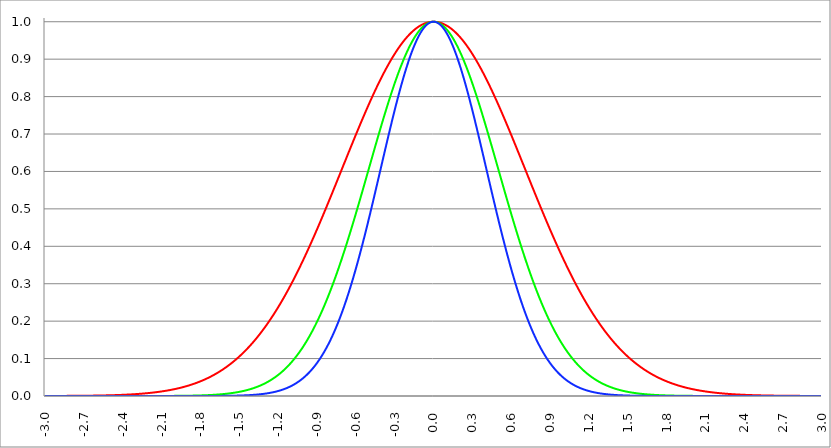
| Category | Series 1 | Series 0 | Series 2 |
|---|---|---|---|
| -3.0 | 0 | 0 | 0 |
| -2.997 | 0 | 0 | 0 |
| -2.994 | 0 | 0 | 0 |
| -2.991 | 0 | 0 | 0 |
| -2.988 | 0 | 0 | 0 |
| -2.984999999999999 | 0 | 0 | 0 |
| -2.981999999999999 | 0 | 0 | 0 |
| -2.978999999999999 | 0 | 0 | 0 |
| -2.975999999999999 | 0 | 0 | 0 |
| -2.972999999999999 | 0 | 0 | 0 |
| -2.969999999999999 | 0 | 0 | 0 |
| -2.966999999999999 | 0 | 0 | 0 |
| -2.963999999999999 | 0 | 0 | 0 |
| -2.960999999999998 | 0 | 0 | 0 |
| -2.957999999999998 | 0 | 0 | 0 |
| -2.954999999999998 | 0 | 0 | 0 |
| -2.951999999999998 | 0 | 0 | 0 |
| -2.948999999999998 | 0 | 0 | 0 |
| -2.945999999999998 | 0 | 0 | 0 |
| -2.942999999999998 | 0 | 0 | 0 |
| -2.939999999999998 | 0 | 0 | 0 |
| -2.936999999999998 | 0 | 0 | 0 |
| -2.933999999999997 | 0 | 0 | 0 |
| -2.930999999999997 | 0 | 0 | 0 |
| -2.927999999999997 | 0 | 0 | 0 |
| -2.924999999999997 | 0 | 0 | 0 |
| -2.921999999999997 | 0 | 0 | 0 |
| -2.918999999999997 | 0 | 0 | 0 |
| -2.915999999999997 | 0 | 0 | 0 |
| -2.912999999999997 | 0 | 0 | 0 |
| -2.909999999999997 | 0 | 0 | 0 |
| -2.906999999999996 | 0 | 0 | 0 |
| -2.903999999999996 | 0 | 0 | 0 |
| -2.900999999999996 | 0 | 0 | 0 |
| -2.897999999999996 | 0 | 0 | 0 |
| -2.894999999999996 | 0 | 0 | 0 |
| -2.891999999999996 | 0 | 0 | 0 |
| -2.888999999999996 | 0 | 0 | 0 |
| -2.885999999999996 | 0 | 0 | 0 |
| -2.882999999999996 | 0 | 0 | 0 |
| -2.879999999999995 | 0 | 0 | 0 |
| -2.876999999999995 | 0 | 0 | 0 |
| -2.873999999999995 | 0 | 0 | 0 |
| -2.870999999999995 | 0 | 0 | 0 |
| -2.867999999999995 | 0 | 0 | 0 |
| -2.864999999999995 | 0 | 0 | 0 |
| -2.861999999999995 | 0 | 0 | 0 |
| -2.858999999999995 | 0 | 0 | 0 |
| -2.855999999999994 | 0 | 0 | 0 |
| -2.852999999999994 | 0 | 0 | 0 |
| -2.849999999999994 | 0 | 0 | 0 |
| -2.846999999999994 | 0 | 0 | 0 |
| -2.843999999999994 | 0 | 0 | 0 |
| -2.840999999999994 | 0 | 0 | 0 |
| -2.837999999999994 | 0 | 0 | 0 |
| -2.834999999999994 | 0 | 0 | 0 |
| -2.831999999999994 | 0 | 0 | 0 |
| -2.828999999999993 | 0 | 0 | 0 |
| -2.825999999999993 | 0 | 0 | 0 |
| -2.822999999999993 | 0 | 0 | 0 |
| -2.819999999999993 | 0 | 0 | 0 |
| -2.816999999999993 | 0 | 0 | 0 |
| -2.813999999999993 | 0 | 0 | 0 |
| -2.810999999999993 | 0 | 0 | 0 |
| -2.807999999999993 | 0 | 0 | 0 |
| -2.804999999999993 | 0 | 0 | 0 |
| -2.801999999999992 | 0 | 0 | 0 |
| -2.798999999999992 | 0 | 0 | 0 |
| -2.795999999999992 | 0 | 0 | 0 |
| -2.792999999999992 | 0 | 0 | 0 |
| -2.789999999999992 | 0 | 0 | 0 |
| -2.786999999999992 | 0 | 0 | 0 |
| -2.783999999999992 | 0 | 0 | 0 |
| -2.780999999999992 | 0 | 0 | 0 |
| -2.777999999999992 | 0 | 0 | 0 |
| -2.774999999999991 | 0 | 0 | 0 |
| -2.771999999999991 | 0 | 0 | 0 |
| -2.768999999999991 | 0 | 0 | 0 |
| -2.765999999999991 | 0 | 0 | 0 |
| -2.762999999999991 | 0 | 0 | 0 |
| -2.759999999999991 | 0 | 0 | 0 |
| -2.756999999999991 | 0 | 0 | 0 |
| -2.753999999999991 | 0.001 | 0 | 0 |
| -2.75099999999999 | 0.001 | 0 | 0 |
| -2.74799999999999 | 0.001 | 0 | 0 |
| -2.74499999999999 | 0.001 | 0 | 0 |
| -2.74199999999999 | 0.001 | 0 | 0 |
| -2.73899999999999 | 0.001 | 0 | 0 |
| -2.73599999999999 | 0.001 | 0 | 0 |
| -2.73299999999999 | 0.001 | 0 | 0 |
| -2.72999999999999 | 0.001 | 0 | 0 |
| -2.72699999999999 | 0.001 | 0 | 0 |
| -2.723999999999989 | 0.001 | 0 | 0 |
| -2.720999999999989 | 0.001 | 0 | 0 |
| -2.717999999999989 | 0.001 | 0 | 0 |
| -2.714999999999989 | 0.001 | 0 | 0 |
| -2.711999999999989 | 0.001 | 0 | 0 |
| -2.708999999999989 | 0.001 | 0 | 0 |
| -2.705999999999989 | 0.001 | 0 | 0 |
| -2.702999999999989 | 0.001 | 0 | 0 |
| -2.699999999999989 | 0.001 | 0 | 0 |
| -2.696999999999988 | 0.001 | 0 | 0 |
| -2.693999999999988 | 0.001 | 0 | 0 |
| -2.690999999999988 | 0.001 | 0 | 0 |
| -2.687999999999988 | 0.001 | 0 | 0 |
| -2.684999999999988 | 0.001 | 0 | 0 |
| -2.681999999999988 | 0.001 | 0 | 0 |
| -2.678999999999988 | 0.001 | 0 | 0 |
| -2.675999999999988 | 0.001 | 0 | 0 |
| -2.672999999999988 | 0.001 | 0 | 0 |
| -2.669999999999987 | 0.001 | 0 | 0 |
| -2.666999999999987 | 0.001 | 0 | 0 |
| -2.663999999999987 | 0.001 | 0 | 0 |
| -2.660999999999987 | 0.001 | 0 | 0 |
| -2.657999999999987 | 0.001 | 0 | 0 |
| -2.654999999999987 | 0.001 | 0 | 0 |
| -2.651999999999987 | 0.001 | 0 | 0 |
| -2.648999999999987 | 0.001 | 0 | 0 |
| -2.645999999999986 | 0.001 | 0 | 0 |
| -2.642999999999986 | 0.001 | 0 | 0 |
| -2.639999999999986 | 0.001 | 0 | 0 |
| -2.636999999999986 | 0.001 | 0 | 0 |
| -2.633999999999986 | 0.001 | 0 | 0 |
| -2.630999999999986 | 0.001 | 0 | 0 |
| -2.627999999999986 | 0.001 | 0 | 0 |
| -2.624999999999986 | 0.001 | 0 | 0 |
| -2.621999999999986 | 0.001 | 0 | 0 |
| -2.618999999999985 | 0.001 | 0 | 0 |
| -2.615999999999985 | 0.001 | 0 | 0 |
| -2.612999999999985 | 0.001 | 0 | 0 |
| -2.609999999999985 | 0.001 | 0 | 0 |
| -2.606999999999985 | 0.001 | 0 | 0 |
| -2.603999999999985 | 0.001 | 0 | 0 |
| -2.600999999999985 | 0.001 | 0 | 0 |
| -2.597999999999985 | 0.001 | 0 | 0 |
| -2.594999999999985 | 0.001 | 0 | 0 |
| -2.591999999999985 | 0.001 | 0 | 0 |
| -2.588999999999984 | 0.001 | 0 | 0 |
| -2.585999999999984 | 0.001 | 0 | 0 |
| -2.582999999999984 | 0.001 | 0 | 0 |
| -2.579999999999984 | 0.001 | 0 | 0 |
| -2.576999999999984 | 0.001 | 0 | 0 |
| -2.573999999999984 | 0.001 | 0 | 0 |
| -2.570999999999984 | 0.001 | 0 | 0 |
| -2.567999999999984 | 0.001 | 0 | 0 |
| -2.564999999999984 | 0.001 | 0 | 0 |
| -2.561999999999983 | 0.001 | 0 | 0 |
| -2.558999999999983 | 0.001 | 0 | 0 |
| -2.555999999999983 | 0.001 | 0 | 0 |
| -2.552999999999983 | 0.001 | 0 | 0 |
| -2.549999999999983 | 0.001 | 0 | 0 |
| -2.546999999999983 | 0.002 | 0 | 0 |
| -2.543999999999983 | 0.002 | 0 | 0 |
| -2.540999999999983 | 0.002 | 0 | 0 |
| -2.537999999999982 | 0.002 | 0 | 0 |
| -2.534999999999982 | 0.002 | 0 | 0 |
| -2.531999999999982 | 0.002 | 0 | 0 |
| -2.528999999999982 | 0.002 | 0 | 0 |
| -2.525999999999982 | 0.002 | 0 | 0 |
| -2.522999999999982 | 0.002 | 0 | 0 |
| -2.519999999999982 | 0.002 | 0 | 0 |
| -2.516999999999982 | 0.002 | 0 | 0 |
| -2.513999999999982 | 0.002 | 0 | 0 |
| -2.510999999999981 | 0.002 | 0 | 0 |
| -2.507999999999981 | 0.002 | 0 | 0 |
| -2.504999999999981 | 0.002 | 0 | 0 |
| -2.501999999999981 | 0.002 | 0 | 0 |
| -2.498999999999981 | 0.002 | 0 | 0 |
| -2.495999999999981 | 0.002 | 0 | 0 |
| -2.492999999999981 | 0.002 | 0 | 0 |
| -2.489999999999981 | 0.002 | 0 | 0 |
| -2.486999999999981 | 0.002 | 0 | 0 |
| -2.48399999999998 | 0.002 | 0 | 0 |
| -2.48099999999998 | 0.002 | 0 | 0 |
| -2.47799999999998 | 0.002 | 0 | 0 |
| -2.47499999999998 | 0.002 | 0 | 0 |
| -2.47199999999998 | 0.002 | 0 | 0 |
| -2.46899999999998 | 0.002 | 0 | 0 |
| -2.46599999999998 | 0.002 | 0 | 0 |
| -2.46299999999998 | 0.002 | 0 | 0 |
| -2.45999999999998 | 0.002 | 0 | 0 |
| -2.456999999999979 | 0.002 | 0 | 0 |
| -2.453999999999979 | 0.002 | 0 | 0 |
| -2.450999999999979 | 0.002 | 0 | 0 |
| -2.44799999999998 | 0.002 | 0 | 0 |
| -2.444999999999979 | 0.003 | 0 | 0 |
| -2.441999999999979 | 0.003 | 0 | 0 |
| -2.438999999999979 | 0.003 | 0 | 0 |
| -2.435999999999979 | 0.003 | 0 | 0 |
| -2.432999999999978 | 0.003 | 0 | 0 |
| -2.429999999999978 | 0.003 | 0 | 0 |
| -2.426999999999978 | 0.003 | 0 | 0 |
| -2.423999999999978 | 0.003 | 0 | 0 |
| -2.420999999999978 | 0.003 | 0 | 0 |
| -2.417999999999978 | 0.003 | 0 | 0 |
| -2.414999999999978 | 0.003 | 0 | 0 |
| -2.411999999999978 | 0.003 | 0 | 0 |
| -2.408999999999978 | 0.003 | 0 | 0 |
| -2.405999999999977 | 0.003 | 0 | 0 |
| -2.402999999999977 | 0.003 | 0 | 0 |
| -2.399999999999977 | 0.003 | 0 | 0 |
| -2.396999999999977 | 0.003 | 0 | 0 |
| -2.393999999999977 | 0.003 | 0 | 0 |
| -2.390999999999977 | 0.003 | 0 | 0 |
| -2.387999999999977 | 0.003 | 0 | 0 |
| -2.384999999999977 | 0.003 | 0 | 0 |
| -2.381999999999977 | 0.003 | 0 | 0 |
| -2.378999999999976 | 0.003 | 0 | 0 |
| -2.375999999999976 | 0.004 | 0 | 0 |
| -2.372999999999976 | 0.004 | 0 | 0 |
| -2.369999999999976 | 0.004 | 0 | 0 |
| -2.366999999999976 | 0.004 | 0 | 0 |
| -2.363999999999976 | 0.004 | 0 | 0 |
| -2.360999999999976 | 0.004 | 0 | 0 |
| -2.357999999999976 | 0.004 | 0 | 0 |
| -2.354999999999976 | 0.004 | 0 | 0 |
| -2.351999999999975 | 0.004 | 0 | 0 |
| -2.348999999999975 | 0.004 | 0 | 0 |
| -2.345999999999975 | 0.004 | 0 | 0 |
| -2.342999999999975 | 0.004 | 0 | 0 |
| -2.339999999999975 | 0.004 | 0 | 0 |
| -2.336999999999975 | 0.004 | 0 | 0 |
| -2.333999999999975 | 0.004 | 0 | 0 |
| -2.330999999999975 | 0.004 | 0 | 0 |
| -2.327999999999974 | 0.004 | 0 | 0 |
| -2.324999999999974 | 0.004 | 0 | 0 |
| -2.321999999999974 | 0.005 | 0 | 0 |
| -2.318999999999974 | 0.005 | 0 | 0 |
| -2.315999999999974 | 0.005 | 0 | 0 |
| -2.312999999999974 | 0.005 | 0 | 0 |
| -2.309999999999974 | 0.005 | 0 | 0 |
| -2.306999999999974 | 0.005 | 0 | 0 |
| -2.303999999999974 | 0.005 | 0 | 0 |
| -2.300999999999973 | 0.005 | 0 | 0 |
| -2.297999999999973 | 0.005 | 0 | 0 |
| -2.294999999999973 | 0.005 | 0 | 0 |
| -2.291999999999973 | 0.005 | 0 | 0 |
| -2.288999999999973 | 0.005 | 0 | 0 |
| -2.285999999999973 | 0.005 | 0 | 0 |
| -2.282999999999973 | 0.005 | 0 | 0 |
| -2.279999999999973 | 0.006 | 0 | 0 |
| -2.276999999999973 | 0.006 | 0 | 0 |
| -2.273999999999972 | 0.006 | 0 | 0 |
| -2.270999999999972 | 0.006 | 0 | 0 |
| -2.267999999999972 | 0.006 | 0 | 0 |
| -2.264999999999972 | 0.006 | 0 | 0 |
| -2.261999999999972 | 0.006 | 0 | 0 |
| -2.258999999999972 | 0.006 | 0 | 0 |
| -2.255999999999972 | 0.006 | 0 | 0 |
| -2.252999999999972 | 0.006 | 0 | 0 |
| -2.249999999999972 | 0.006 | 0 | 0 |
| -2.246999999999971 | 0.006 | 0 | 0 |
| -2.243999999999971 | 0.007 | 0 | 0 |
| -2.240999999999971 | 0.007 | 0 | 0 |
| -2.237999999999971 | 0.007 | 0 | 0 |
| -2.234999999999971 | 0.007 | 0 | 0 |
| -2.231999999999971 | 0.007 | 0 | 0 |
| -2.228999999999971 | 0.007 | 0 | 0 |
| -2.225999999999971 | 0.007 | 0 | 0 |
| -2.222999999999971 | 0.007 | 0 | 0 |
| -2.21999999999997 | 0.007 | 0 | 0 |
| -2.21699999999997 | 0.007 | 0 | 0 |
| -2.21399999999997 | 0.007 | 0 | 0 |
| -2.21099999999997 | 0.008 | 0 | 0 |
| -2.20799999999997 | 0.008 | 0 | 0 |
| -2.20499999999997 | 0.008 | 0 | 0 |
| -2.20199999999997 | 0.008 | 0 | 0 |
| -2.19899999999997 | 0.008 | 0 | 0 |
| -2.19599999999997 | 0.008 | 0 | 0 |
| -2.192999999999969 | 0.008 | 0 | 0 |
| -2.189999999999969 | 0.008 | 0 | 0 |
| -2.186999999999969 | 0.008 | 0 | 0 |
| -2.18399999999997 | 0.008 | 0 | 0 |
| -2.180999999999969 | 0.009 | 0 | 0 |
| -2.177999999999969 | 0.009 | 0 | 0 |
| -2.174999999999969 | 0.009 | 0 | 0 |
| -2.171999999999969 | 0.009 | 0 | 0 |
| -2.168999999999968 | 0.009 | 0 | 0 |
| -2.165999999999968 | 0.009 | 0 | 0 |
| -2.162999999999968 | 0.009 | 0 | 0 |
| -2.159999999999968 | 0.009 | 0 | 0 |
| -2.156999999999968 | 0.01 | 0 | 0 |
| -2.153999999999968 | 0.01 | 0 | 0 |
| -2.150999999999968 | 0.01 | 0 | 0 |
| -2.147999999999968 | 0.01 | 0 | 0 |
| -2.144999999999968 | 0.01 | 0 | 0 |
| -2.141999999999967 | 0.01 | 0 | 0 |
| -2.138999999999967 | 0.01 | 0 | 0 |
| -2.135999999999967 | 0.01 | 0 | 0 |
| -2.132999999999967 | 0.011 | 0 | 0 |
| -2.129999999999967 | 0.011 | 0 | 0 |
| -2.126999999999967 | 0.011 | 0 | 0 |
| -2.123999999999967 | 0.011 | 0 | 0 |
| -2.120999999999967 | 0.011 | 0 | 0 |
| -2.117999999999967 | 0.011 | 0 | 0 |
| -2.114999999999966 | 0.011 | 0 | 0 |
| -2.111999999999966 | 0.012 | 0 | 0 |
| -2.108999999999966 | 0.012 | 0 | 0 |
| -2.105999999999966 | 0.012 | 0 | 0 |
| -2.102999999999966 | 0.012 | 0 | 0 |
| -2.099999999999966 | 0.012 | 0 | 0 |
| -2.096999999999966 | 0.012 | 0 | 0 |
| -2.093999999999966 | 0.012 | 0 | 0 |
| -2.090999999999966 | 0.013 | 0 | 0 |
| -2.087999999999965 | 0.013 | 0 | 0 |
| -2.084999999999965 | 0.013 | 0 | 0 |
| -2.081999999999965 | 0.013 | 0 | 0 |
| -2.078999999999965 | 0.013 | 0 | 0 |
| -2.075999999999965 | 0.013 | 0 | 0 |
| -2.072999999999965 | 0.014 | 0 | 0 |
| -2.069999999999965 | 0.014 | 0 | 0 |
| -2.066999999999965 | 0.014 | 0 | 0 |
| -2.063999999999965 | 0.014 | 0 | 0 |
| -2.060999999999964 | 0.014 | 0 | 0 |
| -2.057999999999964 | 0.014 | 0 | 0 |
| -2.054999999999964 | 0.015 | 0 | 0 |
| -2.051999999999964 | 0.015 | 0 | 0 |
| -2.048999999999964 | 0.015 | 0 | 0 |
| -2.045999999999964 | 0.015 | 0 | 0 |
| -2.042999999999964 | 0.015 | 0 | 0 |
| -2.039999999999964 | 0.016 | 0 | 0 |
| -2.036999999999963 | 0.016 | 0 | 0 |
| -2.033999999999963 | 0.016 | 0 | 0 |
| -2.030999999999963 | 0.016 | 0 | 0 |
| -2.027999999999963 | 0.016 | 0 | 0 |
| -2.024999999999963 | 0.017 | 0 | 0 |
| -2.021999999999963 | 0.017 | 0 | 0 |
| -2.018999999999963 | 0.017 | 0 | 0 |
| -2.015999999999963 | 0.017 | 0 | 0 |
| -2.012999999999963 | 0.017 | 0 | 0 |
| -2.009999999999962 | 0.018 | 0 | 0 |
| -2.006999999999962 | 0.018 | 0 | 0 |
| -2.003999999999962 | 0.018 | 0 | 0 |
| -2.000999999999962 | 0.018 | 0 | 0 |
| -1.997999999999962 | 0.018 | 0 | 0 |
| -1.994999999999962 | 0.019 | 0 | 0 |
| -1.991999999999962 | 0.019 | 0 | 0 |
| -1.988999999999963 | 0.019 | 0 | 0 |
| -1.985999999999963 | 0.019 | 0 | 0 |
| -1.982999999999963 | 0.02 | 0 | 0 |
| -1.979999999999963 | 0.02 | 0 | 0 |
| -1.976999999999963 | 0.02 | 0 | 0 |
| -1.973999999999963 | 0.02 | 0 | 0 |
| -1.970999999999963 | 0.021 | 0 | 0 |
| -1.967999999999963 | 0.021 | 0 | 0 |
| -1.964999999999963 | 0.021 | 0 | 0 |
| -1.961999999999964 | 0.021 | 0 | 0 |
| -1.958999999999964 | 0.022 | 0 | 0 |
| -1.955999999999964 | 0.022 | 0 | 0 |
| -1.952999999999964 | 0.022 | 0 | 0 |
| -1.949999999999964 | 0.022 | 0 | 0 |
| -1.946999999999964 | 0.023 | 0.001 | 0 |
| -1.943999999999964 | 0.023 | 0.001 | 0 |
| -1.940999999999964 | 0.023 | 0.001 | 0 |
| -1.937999999999964 | 0.023 | 0.001 | 0 |
| -1.934999999999964 | 0.024 | 0.001 | 0 |
| -1.931999999999965 | 0.024 | 0.001 | 0 |
| -1.928999999999965 | 0.024 | 0.001 | 0 |
| -1.925999999999965 | 0.024 | 0.001 | 0 |
| -1.922999999999965 | 0.025 | 0.001 | 0 |
| -1.919999999999965 | 0.025 | 0.001 | 0 |
| -1.916999999999965 | 0.025 | 0.001 | 0 |
| -1.913999999999965 | 0.026 | 0.001 | 0 |
| -1.910999999999965 | 0.026 | 0.001 | 0 |
| -1.907999999999965 | 0.026 | 0.001 | 0 |
| -1.904999999999966 | 0.027 | 0.001 | 0 |
| -1.901999999999966 | 0.027 | 0.001 | 0 |
| -1.898999999999966 | 0.027 | 0.001 | 0 |
| -1.895999999999966 | 0.027 | 0.001 | 0 |
| -1.892999999999966 | 0.028 | 0.001 | 0 |
| -1.889999999999966 | 0.028 | 0.001 | 0 |
| -1.886999999999966 | 0.028 | 0.001 | 0 |
| -1.883999999999966 | 0.029 | 0.001 | 0 |
| -1.880999999999966 | 0.029 | 0.001 | 0 |
| -1.877999999999967 | 0.029 | 0.001 | 0 |
| -1.874999999999967 | 0.03 | 0.001 | 0 |
| -1.871999999999967 | 0.03 | 0.001 | 0 |
| -1.868999999999967 | 0.03 | 0.001 | 0 |
| -1.865999999999967 | 0.031 | 0.001 | 0 |
| -1.862999999999967 | 0.031 | 0.001 | 0 |
| -1.859999999999967 | 0.031 | 0.001 | 0 |
| -1.856999999999967 | 0.032 | 0.001 | 0 |
| -1.853999999999967 | 0.032 | 0.001 | 0 |
| -1.850999999999968 | 0.033 | 0.001 | 0 |
| -1.847999999999968 | 0.033 | 0.001 | 0 |
| -1.844999999999968 | 0.033 | 0.001 | 0 |
| -1.841999999999968 | 0.034 | 0.001 | 0 |
| -1.838999999999968 | 0.034 | 0.001 | 0 |
| -1.835999999999968 | 0.034 | 0.001 | 0 |
| -1.832999999999968 | 0.035 | 0.001 | 0 |
| -1.829999999999968 | 0.035 | 0.001 | 0 |
| -1.826999999999968 | 0.036 | 0.001 | 0 |
| -1.823999999999968 | 0.036 | 0.001 | 0 |
| -1.820999999999969 | 0.036 | 0.001 | 0 |
| -1.817999999999969 | 0.037 | 0.001 | 0 |
| -1.814999999999969 | 0.037 | 0.001 | 0 |
| -1.811999999999969 | 0.038 | 0.001 | 0 |
| -1.808999999999969 | 0.038 | 0.001 | 0 |
| -1.805999999999969 | 0.038 | 0.001 | 0 |
| -1.802999999999969 | 0.039 | 0.002 | 0 |
| -1.799999999999969 | 0.039 | 0.002 | 0 |
| -1.796999999999969 | 0.04 | 0.002 | 0 |
| -1.79399999999997 | 0.04 | 0.002 | 0 |
| -1.79099999999997 | 0.04 | 0.002 | 0 |
| -1.78799999999997 | 0.041 | 0.002 | 0 |
| -1.78499999999997 | 0.041 | 0.002 | 0 |
| -1.78199999999997 | 0.042 | 0.002 | 0 |
| -1.77899999999997 | 0.042 | 0.002 | 0 |
| -1.77599999999997 | 0.043 | 0.002 | 0 |
| -1.77299999999997 | 0.043 | 0.002 | 0 |
| -1.76999999999997 | 0.044 | 0.002 | 0 |
| -1.766999999999971 | 0.044 | 0.002 | 0 |
| -1.763999999999971 | 0.045 | 0.002 | 0 |
| -1.760999999999971 | 0.045 | 0.002 | 0 |
| -1.757999999999971 | 0.045 | 0.002 | 0 |
| -1.754999999999971 | 0.046 | 0.002 | 0 |
| -1.751999999999971 | 0.046 | 0.002 | 0 |
| -1.748999999999971 | 0.047 | 0.002 | 0 |
| -1.745999999999971 | 0.047 | 0.002 | 0 |
| -1.742999999999971 | 0.048 | 0.002 | 0 |
| -1.739999999999971 | 0.048 | 0.002 | 0 |
| -1.736999999999972 | 0.049 | 0.002 | 0 |
| -1.733999999999972 | 0.049 | 0.002 | 0 |
| -1.730999999999972 | 0.05 | 0.002 | 0 |
| -1.727999999999972 | 0.05 | 0.003 | 0 |
| -1.724999999999972 | 0.051 | 0.003 | 0 |
| -1.721999999999972 | 0.052 | 0.003 | 0 |
| -1.718999999999972 | 0.052 | 0.003 | 0 |
| -1.715999999999972 | 0.053 | 0.003 | 0 |
| -1.712999999999972 | 0.053 | 0.003 | 0 |
| -1.709999999999973 | 0.054 | 0.003 | 0 |
| -1.706999999999973 | 0.054 | 0.003 | 0 |
| -1.703999999999973 | 0.055 | 0.003 | 0 |
| -1.700999999999973 | 0.055 | 0.003 | 0 |
| -1.697999999999973 | 0.056 | 0.003 | 0 |
| -1.694999999999973 | 0.057 | 0.003 | 0 |
| -1.691999999999973 | 0.057 | 0.003 | 0 |
| -1.688999999999973 | 0.058 | 0.003 | 0 |
| -1.685999999999973 | 0.058 | 0.003 | 0 |
| -1.682999999999974 | 0.059 | 0.003 | 0 |
| -1.679999999999974 | 0.059 | 0.004 | 0 |
| -1.676999999999974 | 0.06 | 0.004 | 0 |
| -1.673999999999974 | 0.061 | 0.004 | 0 |
| -1.670999999999974 | 0.061 | 0.004 | 0 |
| -1.667999999999974 | 0.062 | 0.004 | 0 |
| -1.664999999999974 | 0.063 | 0.004 | 0 |
| -1.661999999999974 | 0.063 | 0.004 | 0 |
| -1.658999999999974 | 0.064 | 0.004 | 0 |
| -1.655999999999975 | 0.064 | 0.004 | 0 |
| -1.652999999999975 | 0.065 | 0.004 | 0 |
| -1.649999999999975 | 0.066 | 0.004 | 0 |
| -1.646999999999975 | 0.066 | 0.004 | 0 |
| -1.643999999999975 | 0.067 | 0.004 | 0 |
| -1.640999999999975 | 0.068 | 0.005 | 0 |
| -1.637999999999975 | 0.068 | 0.005 | 0 |
| -1.634999999999975 | 0.069 | 0.005 | 0 |
| -1.631999999999975 | 0.07 | 0.005 | 0 |
| -1.628999999999975 | 0.07 | 0.005 | 0 |
| -1.625999999999976 | 0.071 | 0.005 | 0 |
| -1.622999999999976 | 0.072 | 0.005 | 0 |
| -1.619999999999976 | 0.072 | 0.005 | 0 |
| -1.616999999999976 | 0.073 | 0.005 | 0 |
| -1.613999999999976 | 0.074 | 0.005 | 0 |
| -1.610999999999976 | 0.075 | 0.006 | 0 |
| -1.607999999999976 | 0.075 | 0.006 | 0 |
| -1.604999999999976 | 0.076 | 0.006 | 0 |
| -1.601999999999976 | 0.077 | 0.006 | 0 |
| -1.598999999999977 | 0.078 | 0.006 | 0 |
| -1.595999999999977 | 0.078 | 0.006 | 0 |
| -1.592999999999977 | 0.079 | 0.006 | 0 |
| -1.589999999999977 | 0.08 | 0.006 | 0.001 |
| -1.586999999999977 | 0.081 | 0.006 | 0.001 |
| -1.583999999999977 | 0.081 | 0.007 | 0.001 |
| -1.580999999999977 | 0.082 | 0.007 | 0.001 |
| -1.577999999999977 | 0.083 | 0.007 | 0.001 |
| -1.574999999999978 | 0.084 | 0.007 | 0.001 |
| -1.571999999999978 | 0.084 | 0.007 | 0.001 |
| -1.568999999999978 | 0.085 | 0.007 | 0.001 |
| -1.565999999999978 | 0.086 | 0.007 | 0.001 |
| -1.562999999999978 | 0.087 | 0.008 | 0.001 |
| -1.559999999999978 | 0.088 | 0.008 | 0.001 |
| -1.556999999999978 | 0.089 | 0.008 | 0.001 |
| -1.553999999999978 | 0.089 | 0.008 | 0.001 |
| -1.550999999999978 | 0.09 | 0.008 | 0.001 |
| -1.547999999999978 | 0.091 | 0.008 | 0.001 |
| -1.544999999999979 | 0.092 | 0.008 | 0.001 |
| -1.541999999999979 | 0.093 | 0.009 | 0.001 |
| -1.538999999999979 | 0.094 | 0.009 | 0.001 |
| -1.535999999999979 | 0.094 | 0.009 | 0.001 |
| -1.532999999999979 | 0.095 | 0.009 | 0.001 |
| -1.529999999999979 | 0.096 | 0.009 | 0.001 |
| -1.526999999999979 | 0.097 | 0.009 | 0.001 |
| -1.523999999999979 | 0.098 | 0.01 | 0.001 |
| -1.520999999999979 | 0.099 | 0.01 | 0.001 |
| -1.51799999999998 | 0.1 | 0.01 | 0.001 |
| -1.51499999999998 | 0.101 | 0.01 | 0.001 |
| -1.51199999999998 | 0.102 | 0.01 | 0.001 |
| -1.50899999999998 | 0.103 | 0.011 | 0.001 |
| -1.50599999999998 | 0.104 | 0.011 | 0.001 |
| -1.50299999999998 | 0.104 | 0.011 | 0.001 |
| -1.49999999999998 | 0.105 | 0.011 | 0.001 |
| -1.49699999999998 | 0.106 | 0.011 | 0.001 |
| -1.49399999999998 | 0.107 | 0.012 | 0.001 |
| -1.490999999999981 | 0.108 | 0.012 | 0.001 |
| -1.487999999999981 | 0.109 | 0.012 | 0.001 |
| -1.484999999999981 | 0.11 | 0.012 | 0.001 |
| -1.481999999999981 | 0.111 | 0.012 | 0.001 |
| -1.478999999999981 | 0.112 | 0.013 | 0.001 |
| -1.475999999999981 | 0.113 | 0.013 | 0.001 |
| -1.472999999999981 | 0.114 | 0.013 | 0.001 |
| -1.469999999999981 | 0.115 | 0.013 | 0.002 |
| -1.466999999999981 | 0.116 | 0.014 | 0.002 |
| -1.463999999999982 | 0.117 | 0.014 | 0.002 |
| -1.460999999999982 | 0.118 | 0.014 | 0.002 |
| -1.457999999999982 | 0.119 | 0.014 | 0.002 |
| -1.454999999999982 | 0.12 | 0.014 | 0.002 |
| -1.451999999999982 | 0.121 | 0.015 | 0.002 |
| -1.448999999999982 | 0.123 | 0.015 | 0.002 |
| -1.445999999999982 | 0.124 | 0.015 | 0.002 |
| -1.442999999999982 | 0.125 | 0.016 | 0.002 |
| -1.439999999999982 | 0.126 | 0.016 | 0.002 |
| -1.436999999999982 | 0.127 | 0.016 | 0.002 |
| -1.433999999999983 | 0.128 | 0.016 | 0.002 |
| -1.430999999999983 | 0.129 | 0.017 | 0.002 |
| -1.427999999999983 | 0.13 | 0.017 | 0.002 |
| -1.424999999999983 | 0.131 | 0.017 | 0.002 |
| -1.421999999999983 | 0.132 | 0.018 | 0.002 |
| -1.418999999999983 | 0.134 | 0.018 | 0.002 |
| -1.415999999999983 | 0.135 | 0.018 | 0.002 |
| -1.412999999999983 | 0.136 | 0.018 | 0.003 |
| -1.409999999999983 | 0.137 | 0.019 | 0.003 |
| -1.406999999999984 | 0.138 | 0.019 | 0.003 |
| -1.403999999999984 | 0.139 | 0.019 | 0.003 |
| -1.400999999999984 | 0.14 | 0.02 | 0.003 |
| -1.397999999999984 | 0.142 | 0.02 | 0.003 |
| -1.394999999999984 | 0.143 | 0.02 | 0.003 |
| -1.391999999999984 | 0.144 | 0.021 | 0.003 |
| -1.388999999999984 | 0.145 | 0.021 | 0.003 |
| -1.385999999999984 | 0.146 | 0.021 | 0.003 |
| -1.382999999999984 | 0.148 | 0.022 | 0.003 |
| -1.379999999999985 | 0.149 | 0.022 | 0.003 |
| -1.376999999999985 | 0.15 | 0.023 | 0.003 |
| -1.373999999999985 | 0.151 | 0.023 | 0.003 |
| -1.370999999999985 | 0.153 | 0.023 | 0.004 |
| -1.367999999999985 | 0.154 | 0.024 | 0.004 |
| -1.364999999999985 | 0.155 | 0.024 | 0.004 |
| -1.361999999999985 | 0.156 | 0.024 | 0.004 |
| -1.358999999999985 | 0.158 | 0.025 | 0.004 |
| -1.355999999999985 | 0.159 | 0.025 | 0.004 |
| -1.352999999999985 | 0.16 | 0.026 | 0.004 |
| -1.349999999999986 | 0.162 | 0.026 | 0.004 |
| -1.346999999999986 | 0.163 | 0.027 | 0.004 |
| -1.343999999999986 | 0.164 | 0.027 | 0.004 |
| -1.340999999999986 | 0.166 | 0.027 | 0.005 |
| -1.337999999999986 | 0.167 | 0.028 | 0.005 |
| -1.334999999999986 | 0.168 | 0.028 | 0.005 |
| -1.331999999999986 | 0.17 | 0.029 | 0.005 |
| -1.328999999999986 | 0.171 | 0.029 | 0.005 |
| -1.325999999999986 | 0.172 | 0.03 | 0.005 |
| -1.322999999999987 | 0.174 | 0.03 | 0.005 |
| -1.319999999999987 | 0.175 | 0.031 | 0.005 |
| -1.316999999999987 | 0.176 | 0.031 | 0.005 |
| -1.313999999999987 | 0.178 | 0.032 | 0.006 |
| -1.310999999999987 | 0.179 | 0.032 | 0.006 |
| -1.307999999999987 | 0.181 | 0.033 | 0.006 |
| -1.304999999999987 | 0.182 | 0.033 | 0.006 |
| -1.301999999999987 | 0.184 | 0.034 | 0.006 |
| -1.298999999999987 | 0.185 | 0.034 | 0.006 |
| -1.295999999999988 | 0.186 | 0.035 | 0.006 |
| -1.292999999999988 | 0.188 | 0.035 | 0.007 |
| -1.289999999999988 | 0.189 | 0.036 | 0.007 |
| -1.286999999999988 | 0.191 | 0.036 | 0.007 |
| -1.283999999999988 | 0.192 | 0.037 | 0.007 |
| -1.280999999999988 | 0.194 | 0.038 | 0.007 |
| -1.277999999999988 | 0.195 | 0.038 | 0.007 |
| -1.274999999999988 | 0.197 | 0.039 | 0.008 |
| -1.271999999999988 | 0.198 | 0.039 | 0.008 |
| -1.268999999999989 | 0.2 | 0.04 | 0.008 |
| -1.265999999999989 | 0.201 | 0.041 | 0.008 |
| -1.262999999999989 | 0.203 | 0.041 | 0.008 |
| -1.259999999999989 | 0.204 | 0.042 | 0.009 |
| -1.256999999999989 | 0.206 | 0.042 | 0.009 |
| -1.253999999999989 | 0.208 | 0.043 | 0.009 |
| -1.250999999999989 | 0.209 | 0.044 | 0.009 |
| -1.247999999999989 | 0.211 | 0.044 | 0.009 |
| -1.244999999999989 | 0.212 | 0.045 | 0.01 |
| -1.24199999999999 | 0.214 | 0.046 | 0.01 |
| -1.23899999999999 | 0.215 | 0.046 | 0.01 |
| -1.23599999999999 | 0.217 | 0.047 | 0.01 |
| -1.23299999999999 | 0.219 | 0.048 | 0.01 |
| -1.22999999999999 | 0.22 | 0.049 | 0.011 |
| -1.22699999999999 | 0.222 | 0.049 | 0.011 |
| -1.22399999999999 | 0.224 | 0.05 | 0.011 |
| -1.22099999999999 | 0.225 | 0.051 | 0.011 |
| -1.21799999999999 | 0.227 | 0.051 | 0.012 |
| -1.214999999999991 | 0.228 | 0.052 | 0.012 |
| -1.211999999999991 | 0.23 | 0.053 | 0.012 |
| -1.208999999999991 | 0.232 | 0.054 | 0.012 |
| -1.205999999999991 | 0.234 | 0.055 | 0.013 |
| -1.202999999999991 | 0.235 | 0.055 | 0.013 |
| -1.199999999999991 | 0.237 | 0.056 | 0.013 |
| -1.196999999999991 | 0.239 | 0.057 | 0.014 |
| -1.193999999999991 | 0.24 | 0.058 | 0.014 |
| -1.190999999999991 | 0.242 | 0.059 | 0.014 |
| -1.187999999999991 | 0.244 | 0.059 | 0.014 |
| -1.184999999999992 | 0.246 | 0.06 | 0.015 |
| -1.181999999999992 | 0.247 | 0.061 | 0.015 |
| -1.178999999999992 | 0.249 | 0.062 | 0.015 |
| -1.175999999999992 | 0.251 | 0.063 | 0.016 |
| -1.172999999999992 | 0.253 | 0.064 | 0.016 |
| -1.169999999999992 | 0.254 | 0.065 | 0.016 |
| -1.166999999999992 | 0.256 | 0.066 | 0.017 |
| -1.163999999999992 | 0.258 | 0.067 | 0.017 |
| -1.160999999999992 | 0.26 | 0.067 | 0.018 |
| -1.157999999999993 | 0.262 | 0.068 | 0.018 |
| -1.154999999999993 | 0.263 | 0.069 | 0.018 |
| -1.151999999999993 | 0.265 | 0.07 | 0.019 |
| -1.148999999999993 | 0.267 | 0.071 | 0.019 |
| -1.145999999999993 | 0.269 | 0.072 | 0.019 |
| -1.142999999999993 | 0.271 | 0.073 | 0.02 |
| -1.139999999999993 | 0.273 | 0.074 | 0.02 |
| -1.136999999999993 | 0.275 | 0.075 | 0.021 |
| -1.133999999999993 | 0.276 | 0.076 | 0.021 |
| -1.130999999999994 | 0.278 | 0.077 | 0.022 |
| -1.127999999999994 | 0.28 | 0.078 | 0.022 |
| -1.124999999999994 | 0.282 | 0.08 | 0.022 |
| -1.121999999999994 | 0.284 | 0.081 | 0.023 |
| -1.118999999999994 | 0.286 | 0.082 | 0.023 |
| -1.115999999999994 | 0.288 | 0.083 | 0.024 |
| -1.112999999999994 | 0.29 | 0.084 | 0.024 |
| -1.109999999999994 | 0.292 | 0.085 | 0.025 |
| -1.106999999999994 | 0.294 | 0.086 | 0.025 |
| -1.103999999999995 | 0.296 | 0.087 | 0.026 |
| -1.100999999999995 | 0.298 | 0.089 | 0.026 |
| -1.097999999999995 | 0.3 | 0.09 | 0.027 |
| -1.094999999999995 | 0.301 | 0.091 | 0.027 |
| -1.091999999999995 | 0.303 | 0.092 | 0.028 |
| -1.088999999999995 | 0.305 | 0.093 | 0.029 |
| -1.085999999999995 | 0.307 | 0.095 | 0.029 |
| -1.082999999999995 | 0.309 | 0.096 | 0.03 |
| -1.079999999999995 | 0.311 | 0.097 | 0.03 |
| -1.076999999999996 | 0.314 | 0.098 | 0.031 |
| -1.073999999999996 | 0.316 | 0.1 | 0.031 |
| -1.070999999999996 | 0.318 | 0.101 | 0.032 |
| -1.067999999999996 | 0.32 | 0.102 | 0.033 |
| -1.064999999999996 | 0.322 | 0.103 | 0.033 |
| -1.061999999999996 | 0.324 | 0.105 | 0.034 |
| -1.058999999999996 | 0.326 | 0.106 | 0.035 |
| -1.055999999999996 | 0.328 | 0.107 | 0.035 |
| -1.052999999999996 | 0.33 | 0.109 | 0.036 |
| -1.049999999999996 | 0.332 | 0.11 | 0.037 |
| -1.046999999999997 | 0.334 | 0.112 | 0.037 |
| -1.043999999999997 | 0.336 | 0.113 | 0.038 |
| -1.040999999999997 | 0.338 | 0.114 | 0.039 |
| -1.037999999999997 | 0.34 | 0.116 | 0.039 |
| -1.034999999999997 | 0.343 | 0.117 | 0.04 |
| -1.031999999999997 | 0.345 | 0.119 | 0.041 |
| -1.028999999999997 | 0.347 | 0.12 | 0.042 |
| -1.025999999999997 | 0.349 | 0.122 | 0.043 |
| -1.022999999999997 | 0.351 | 0.123 | 0.043 |
| -1.019999999999998 | 0.353 | 0.125 | 0.044 |
| -1.016999999999998 | 0.355 | 0.126 | 0.045 |
| -1.013999999999998 | 0.358 | 0.128 | 0.046 |
| -1.010999999999998 | 0.36 | 0.129 | 0.047 |
| -1.007999999999998 | 0.362 | 0.131 | 0.047 |
| -1.004999999999998 | 0.364 | 0.133 | 0.048 |
| -1.001999999999998 | 0.366 | 0.134 | 0.049 |
| -0.998999999999998 | 0.369 | 0.136 | 0.05 |
| -0.995999999999998 | 0.371 | 0.138 | 0.051 |
| -0.992999999999998 | 0.373 | 0.139 | 0.052 |
| -0.989999999999998 | 0.375 | 0.141 | 0.053 |
| -0.986999999999998 | 0.378 | 0.143 | 0.054 |
| -0.983999999999998 | 0.38 | 0.144 | 0.055 |
| -0.980999999999998 | 0.382 | 0.146 | 0.056 |
| -0.977999999999998 | 0.384 | 0.148 | 0.057 |
| -0.974999999999998 | 0.386 | 0.149 | 0.058 |
| -0.971999999999998 | 0.389 | 0.151 | 0.059 |
| -0.968999999999998 | 0.391 | 0.153 | 0.06 |
| -0.965999999999998 | 0.393 | 0.155 | 0.061 |
| -0.962999999999998 | 0.396 | 0.156 | 0.062 |
| -0.959999999999998 | 0.398 | 0.158 | 0.063 |
| -0.956999999999998 | 0.4 | 0.16 | 0.064 |
| -0.953999999999998 | 0.402 | 0.162 | 0.065 |
| -0.950999999999998 | 0.405 | 0.164 | 0.066 |
| -0.947999999999998 | 0.407 | 0.166 | 0.067 |
| -0.944999999999998 | 0.409 | 0.168 | 0.069 |
| -0.941999999999998 | 0.412 | 0.17 | 0.07 |
| -0.938999999999998 | 0.414 | 0.171 | 0.071 |
| -0.935999999999998 | 0.416 | 0.173 | 0.072 |
| -0.932999999999998 | 0.419 | 0.175 | 0.073 |
| -0.929999999999998 | 0.421 | 0.177 | 0.075 |
| -0.926999999999998 | 0.423 | 0.179 | 0.076 |
| -0.923999999999998 | 0.426 | 0.181 | 0.077 |
| -0.920999999999998 | 0.428 | 0.183 | 0.078 |
| -0.917999999999998 | 0.431 | 0.185 | 0.08 |
| -0.914999999999998 | 0.433 | 0.187 | 0.081 |
| -0.911999999999998 | 0.435 | 0.189 | 0.082 |
| -0.908999999999998 | 0.438 | 0.192 | 0.084 |
| -0.905999999999998 | 0.44 | 0.194 | 0.085 |
| -0.902999999999998 | 0.442 | 0.196 | 0.087 |
| -0.899999999999998 | 0.445 | 0.198 | 0.088 |
| -0.896999999999998 | 0.447 | 0.2 | 0.089 |
| -0.893999999999998 | 0.45 | 0.202 | 0.091 |
| -0.890999999999998 | 0.452 | 0.204 | 0.092 |
| -0.887999999999998 | 0.455 | 0.207 | 0.094 |
| -0.884999999999998 | 0.457 | 0.209 | 0.095 |
| -0.881999999999998 | 0.459 | 0.211 | 0.097 |
| -0.878999999999998 | 0.462 | 0.213 | 0.098 |
| -0.875999999999998 | 0.464 | 0.216 | 0.1 |
| -0.872999999999998 | 0.467 | 0.218 | 0.102 |
| -0.869999999999998 | 0.469 | 0.22 | 0.103 |
| -0.866999999999998 | 0.472 | 0.222 | 0.105 |
| -0.863999999999998 | 0.474 | 0.225 | 0.107 |
| -0.860999999999998 | 0.476 | 0.227 | 0.108 |
| -0.857999999999998 | 0.479 | 0.229 | 0.11 |
| -0.854999999999998 | 0.481 | 0.232 | 0.112 |
| -0.851999999999998 | 0.484 | 0.234 | 0.113 |
| -0.848999999999998 | 0.486 | 0.237 | 0.115 |
| -0.845999999999998 | 0.489 | 0.239 | 0.117 |
| -0.842999999999998 | 0.491 | 0.241 | 0.119 |
| -0.839999999999998 | 0.494 | 0.244 | 0.12 |
| -0.836999999999998 | 0.496 | 0.246 | 0.122 |
| -0.833999999999998 | 0.499 | 0.249 | 0.124 |
| -0.830999999999998 | 0.501 | 0.251 | 0.126 |
| -0.827999999999998 | 0.504 | 0.254 | 0.128 |
| -0.824999999999998 | 0.506 | 0.256 | 0.13 |
| -0.821999999999998 | 0.509 | 0.259 | 0.132 |
| -0.818999999999998 | 0.511 | 0.261 | 0.134 |
| -0.815999999999998 | 0.514 | 0.264 | 0.136 |
| -0.812999999999998 | 0.516 | 0.267 | 0.138 |
| -0.809999999999998 | 0.519 | 0.269 | 0.14 |
| -0.806999999999998 | 0.521 | 0.272 | 0.142 |
| -0.803999999999998 | 0.524 | 0.274 | 0.144 |
| -0.800999999999998 | 0.526 | 0.277 | 0.146 |
| -0.797999999999998 | 0.529 | 0.28 | 0.148 |
| -0.794999999999998 | 0.532 | 0.283 | 0.15 |
| -0.791999999999998 | 0.534 | 0.285 | 0.152 |
| -0.788999999999998 | 0.537 | 0.288 | 0.154 |
| -0.785999999999998 | 0.539 | 0.291 | 0.157 |
| -0.782999999999998 | 0.542 | 0.293 | 0.159 |
| -0.779999999999998 | 0.544 | 0.296 | 0.161 |
| -0.776999999999998 | 0.547 | 0.299 | 0.163 |
| -0.773999999999998 | 0.549 | 0.302 | 0.166 |
| -0.770999999999998 | 0.552 | 0.305 | 0.168 |
| -0.767999999999998 | 0.554 | 0.307 | 0.17 |
| -0.764999999999998 | 0.557 | 0.31 | 0.173 |
| -0.761999999999998 | 0.56 | 0.313 | 0.175 |
| -0.758999999999998 | 0.562 | 0.316 | 0.178 |
| -0.755999999999998 | 0.565 | 0.319 | 0.18 |
| -0.752999999999998 | 0.567 | 0.322 | 0.182 |
| -0.749999999999998 | 0.57 | 0.325 | 0.185 |
| -0.746999999999998 | 0.572 | 0.328 | 0.187 |
| -0.743999999999998 | 0.575 | 0.331 | 0.19 |
| -0.740999999999998 | 0.577 | 0.333 | 0.193 |
| -0.737999999999998 | 0.58 | 0.336 | 0.195 |
| -0.734999999999998 | 0.583 | 0.339 | 0.198 |
| -0.731999999999998 | 0.585 | 0.342 | 0.2 |
| -0.728999999999998 | 0.588 | 0.345 | 0.203 |
| -0.725999999999998 | 0.59 | 0.348 | 0.206 |
| -0.722999999999998 | 0.593 | 0.352 | 0.208 |
| -0.719999999999998 | 0.595 | 0.355 | 0.211 |
| -0.716999999999998 | 0.598 | 0.358 | 0.214 |
| -0.713999999999998 | 0.601 | 0.361 | 0.217 |
| -0.710999999999998 | 0.603 | 0.364 | 0.219 |
| -0.707999999999998 | 0.606 | 0.367 | 0.222 |
| -0.704999999999998 | 0.608 | 0.37 | 0.225 |
| -0.701999999999998 | 0.611 | 0.373 | 0.228 |
| -0.698999999999998 | 0.613 | 0.376 | 0.231 |
| -0.695999999999998 | 0.616 | 0.38 | 0.234 |
| -0.692999999999998 | 0.619 | 0.383 | 0.237 |
| -0.689999999999998 | 0.621 | 0.386 | 0.24 |
| -0.686999999999998 | 0.624 | 0.389 | 0.243 |
| -0.683999999999998 | 0.626 | 0.392 | 0.246 |
| -0.680999999999998 | 0.629 | 0.396 | 0.249 |
| -0.677999999999998 | 0.631 | 0.399 | 0.252 |
| -0.674999999999998 | 0.634 | 0.402 | 0.255 |
| -0.671999999999998 | 0.637 | 0.405 | 0.258 |
| -0.668999999999998 | 0.639 | 0.409 | 0.261 |
| -0.665999999999998 | 0.642 | 0.412 | 0.264 |
| -0.662999999999998 | 0.644 | 0.415 | 0.267 |
| -0.659999999999998 | 0.647 | 0.418 | 0.271 |
| -0.656999999999998 | 0.649 | 0.422 | 0.274 |
| -0.653999999999998 | 0.652 | 0.425 | 0.277 |
| -0.650999999999998 | 0.655 | 0.428 | 0.28 |
| -0.647999999999998 | 0.657 | 0.432 | 0.284 |
| -0.644999999999998 | 0.66 | 0.435 | 0.287 |
| -0.641999999999998 | 0.662 | 0.439 | 0.29 |
| -0.638999999999998 | 0.665 | 0.442 | 0.294 |
| -0.635999999999998 | 0.667 | 0.445 | 0.297 |
| -0.632999999999998 | 0.67 | 0.449 | 0.301 |
| -0.629999999999998 | 0.672 | 0.452 | 0.304 |
| -0.626999999999998 | 0.675 | 0.456 | 0.307 |
| -0.623999999999998 | 0.677 | 0.459 | 0.311 |
| -0.620999999999998 | 0.68 | 0.462 | 0.314 |
| -0.617999999999998 | 0.683 | 0.466 | 0.318 |
| -0.614999999999998 | 0.685 | 0.469 | 0.322 |
| -0.611999999999998 | 0.688 | 0.473 | 0.325 |
| -0.608999999999998 | 0.69 | 0.476 | 0.329 |
| -0.605999999999998 | 0.693 | 0.48 | 0.332 |
| -0.602999999999998 | 0.695 | 0.483 | 0.336 |
| -0.599999999999998 | 0.698 | 0.487 | 0.34 |
| -0.596999999999998 | 0.7 | 0.49 | 0.343 |
| -0.593999999999998 | 0.703 | 0.494 | 0.347 |
| -0.590999999999998 | 0.705 | 0.497 | 0.351 |
| -0.587999999999998 | 0.708 | 0.501 | 0.354 |
| -0.584999999999998 | 0.71 | 0.504 | 0.358 |
| -0.581999999999998 | 0.713 | 0.508 | 0.362 |
| -0.578999999999998 | 0.715 | 0.511 | 0.366 |
| -0.575999999999998 | 0.718 | 0.515 | 0.37 |
| -0.572999999999998 | 0.72 | 0.519 | 0.373 |
| -0.569999999999998 | 0.723 | 0.522 | 0.377 |
| -0.566999999999998 | 0.725 | 0.526 | 0.381 |
| -0.563999999999998 | 0.728 | 0.529 | 0.385 |
| -0.560999999999998 | 0.73 | 0.533 | 0.389 |
| -0.557999999999998 | 0.732 | 0.536 | 0.393 |
| -0.554999999999998 | 0.735 | 0.54 | 0.397 |
| -0.551999999999998 | 0.737 | 0.544 | 0.401 |
| -0.548999999999998 | 0.74 | 0.547 | 0.405 |
| -0.545999999999998 | 0.742 | 0.551 | 0.409 |
| -0.542999999999998 | 0.745 | 0.554 | 0.413 |
| -0.539999999999998 | 0.747 | 0.558 | 0.417 |
| -0.536999999999998 | 0.749 | 0.562 | 0.421 |
| -0.533999999999998 | 0.752 | 0.565 | 0.425 |
| -0.530999999999998 | 0.754 | 0.569 | 0.429 |
| -0.527999999999998 | 0.757 | 0.573 | 0.433 |
| -0.524999999999998 | 0.759 | 0.576 | 0.437 |
| -0.521999999999998 | 0.761 | 0.58 | 0.442 |
| -0.518999999999998 | 0.764 | 0.583 | 0.446 |
| -0.515999999999998 | 0.766 | 0.587 | 0.45 |
| -0.512999999999998 | 0.769 | 0.591 | 0.454 |
| -0.509999999999998 | 0.771 | 0.594 | 0.458 |
| -0.506999999999998 | 0.773 | 0.598 | 0.462 |
| -0.503999999999998 | 0.776 | 0.602 | 0.467 |
| -0.500999999999998 | 0.778 | 0.605 | 0.471 |
| -0.497999999999998 | 0.78 | 0.609 | 0.475 |
| -0.494999999999998 | 0.783 | 0.613 | 0.479 |
| -0.491999999999998 | 0.785 | 0.616 | 0.484 |
| -0.488999999999998 | 0.787 | 0.62 | 0.488 |
| -0.485999999999998 | 0.79 | 0.624 | 0.492 |
| -0.482999999999998 | 0.792 | 0.627 | 0.497 |
| -0.479999999999998 | 0.794 | 0.631 | 0.501 |
| -0.476999999999998 | 0.796 | 0.634 | 0.505 |
| -0.473999999999998 | 0.799 | 0.638 | 0.51 |
| -0.470999999999998 | 0.801 | 0.642 | 0.514 |
| -0.467999999999998 | 0.803 | 0.645 | 0.518 |
| -0.464999999999998 | 0.806 | 0.649 | 0.523 |
| -0.461999999999998 | 0.808 | 0.653 | 0.527 |
| -0.458999999999998 | 0.81 | 0.656 | 0.532 |
| -0.455999999999998 | 0.812 | 0.66 | 0.536 |
| -0.452999999999998 | 0.814 | 0.663 | 0.54 |
| -0.449999999999998 | 0.817 | 0.667 | 0.545 |
| -0.446999999999998 | 0.819 | 0.671 | 0.549 |
| -0.443999999999998 | 0.821 | 0.674 | 0.554 |
| -0.440999999999998 | 0.823 | 0.678 | 0.558 |
| -0.437999999999998 | 0.825 | 0.681 | 0.562 |
| -0.434999999999998 | 0.828 | 0.685 | 0.567 |
| -0.431999999999998 | 0.83 | 0.688 | 0.571 |
| -0.428999999999998 | 0.832 | 0.692 | 0.576 |
| -0.425999999999998 | 0.834 | 0.696 | 0.58 |
| -0.422999999999998 | 0.836 | 0.699 | 0.585 |
| -0.419999999999998 | 0.838 | 0.703 | 0.589 |
| -0.416999999999998 | 0.84 | 0.706 | 0.594 |
| -0.413999999999998 | 0.842 | 0.71 | 0.598 |
| -0.410999999999998 | 0.845 | 0.713 | 0.602 |
| -0.407999999999998 | 0.847 | 0.717 | 0.607 |
| -0.404999999999998 | 0.849 | 0.72 | 0.611 |
| -0.401999999999998 | 0.851 | 0.724 | 0.616 |
| -0.398999999999998 | 0.853 | 0.727 | 0.62 |
| -0.395999999999998 | 0.855 | 0.731 | 0.625 |
| -0.392999999999998 | 0.857 | 0.734 | 0.629 |
| -0.389999999999998 | 0.859 | 0.738 | 0.634 |
| -0.386999999999998 | 0.861 | 0.741 | 0.638 |
| -0.383999999999998 | 0.863 | 0.745 | 0.643 |
| -0.380999999999998 | 0.865 | 0.748 | 0.647 |
| -0.377999999999998 | 0.867 | 0.751 | 0.651 |
| -0.374999999999998 | 0.869 | 0.755 | 0.656 |
| -0.371999999999998 | 0.871 | 0.758 | 0.66 |
| -0.368999999999998 | 0.873 | 0.762 | 0.665 |
| -0.365999999999998 | 0.875 | 0.765 | 0.669 |
| -0.362999999999998 | 0.877 | 0.768 | 0.673 |
| -0.359999999999998 | 0.878 | 0.772 | 0.678 |
| -0.356999999999998 | 0.88 | 0.775 | 0.682 |
| -0.353999999999998 | 0.882 | 0.778 | 0.687 |
| -0.350999999999998 | 0.884 | 0.782 | 0.691 |
| -0.347999999999998 | 0.886 | 0.785 | 0.695 |
| -0.344999999999998 | 0.888 | 0.788 | 0.7 |
| -0.341999999999998 | 0.89 | 0.791 | 0.704 |
| -0.338999999999998 | 0.891 | 0.795 | 0.708 |
| -0.335999999999998 | 0.893 | 0.798 | 0.713 |
| -0.332999999999998 | 0.895 | 0.801 | 0.717 |
| -0.329999999999998 | 0.897 | 0.804 | 0.721 |
| -0.326999999999998 | 0.899 | 0.807 | 0.726 |
| -0.323999999999998 | 0.9 | 0.811 | 0.73 |
| -0.320999999999998 | 0.902 | 0.814 | 0.734 |
| -0.317999999999998 | 0.904 | 0.817 | 0.738 |
| -0.314999999999998 | 0.906 | 0.82 | 0.743 |
| -0.311999999999998 | 0.907 | 0.823 | 0.747 |
| -0.308999999999998 | 0.909 | 0.826 | 0.751 |
| -0.305999999999998 | 0.911 | 0.829 | 0.755 |
| -0.302999999999998 | 0.912 | 0.832 | 0.759 |
| -0.299999999999998 | 0.914 | 0.835 | 0.763 |
| -0.296999999999998 | 0.916 | 0.838 | 0.767 |
| -0.293999999999998 | 0.917 | 0.841 | 0.772 |
| -0.290999999999998 | 0.919 | 0.844 | 0.776 |
| -0.287999999999998 | 0.92 | 0.847 | 0.78 |
| -0.284999999999998 | 0.922 | 0.85 | 0.784 |
| -0.281999999999998 | 0.924 | 0.853 | 0.788 |
| -0.278999999999998 | 0.925 | 0.856 | 0.792 |
| -0.275999999999998 | 0.927 | 0.859 | 0.796 |
| -0.272999999999998 | 0.928 | 0.862 | 0.8 |
| -0.269999999999998 | 0.93 | 0.864 | 0.804 |
| -0.266999999999998 | 0.931 | 0.867 | 0.807 |
| -0.263999999999998 | 0.933 | 0.87 | 0.811 |
| -0.260999999999998 | 0.934 | 0.873 | 0.815 |
| -0.257999999999998 | 0.936 | 0.875 | 0.819 |
| -0.254999999999998 | 0.937 | 0.878 | 0.823 |
| -0.251999999999998 | 0.938 | 0.881 | 0.827 |
| -0.248999999999998 | 0.94 | 0.883 | 0.83 |
| -0.245999999999998 | 0.941 | 0.886 | 0.834 |
| -0.242999999999998 | 0.943 | 0.889 | 0.838 |
| -0.239999999999998 | 0.944 | 0.891 | 0.841 |
| -0.236999999999998 | 0.945 | 0.894 | 0.845 |
| -0.233999999999998 | 0.947 | 0.896 | 0.849 |
| -0.230999999999998 | 0.948 | 0.899 | 0.852 |
| -0.227999999999998 | 0.949 | 0.901 | 0.856 |
| -0.224999999999998 | 0.951 | 0.904 | 0.859 |
| -0.221999999999998 | 0.952 | 0.906 | 0.863 |
| -0.218999999999998 | 0.953 | 0.909 | 0.866 |
| -0.215999999999998 | 0.954 | 0.911 | 0.869 |
| -0.212999999999998 | 0.956 | 0.913 | 0.873 |
| -0.209999999999998 | 0.957 | 0.916 | 0.876 |
| -0.206999999999998 | 0.958 | 0.918 | 0.879 |
| -0.203999999999998 | 0.959 | 0.92 | 0.883 |
| -0.200999999999998 | 0.96 | 0.922 | 0.886 |
| -0.197999999999997 | 0.962 | 0.925 | 0.889 |
| -0.194999999999997 | 0.963 | 0.927 | 0.892 |
| -0.191999999999997 | 0.964 | 0.929 | 0.895 |
| -0.188999999999997 | 0.965 | 0.931 | 0.898 |
| -0.185999999999997 | 0.966 | 0.933 | 0.901 |
| -0.182999999999997 | 0.967 | 0.935 | 0.904 |
| -0.179999999999997 | 0.968 | 0.937 | 0.907 |
| -0.176999999999997 | 0.969 | 0.939 | 0.91 |
| -0.173999999999997 | 0.97 | 0.941 | 0.913 |
| -0.170999999999997 | 0.971 | 0.943 | 0.916 |
| -0.167999999999997 | 0.972 | 0.945 | 0.919 |
| -0.164999999999997 | 0.973 | 0.947 | 0.922 |
| -0.161999999999997 | 0.974 | 0.949 | 0.924 |
| -0.158999999999997 | 0.975 | 0.951 | 0.927 |
| -0.155999999999997 | 0.976 | 0.952 | 0.93 |
| -0.152999999999997 | 0.977 | 0.954 | 0.932 |
| -0.149999999999997 | 0.978 | 0.956 | 0.935 |
| -0.146999999999997 | 0.979 | 0.958 | 0.937 |
| -0.143999999999997 | 0.979 | 0.959 | 0.94 |
| -0.140999999999997 | 0.98 | 0.961 | 0.942 |
| -0.137999999999997 | 0.981 | 0.963 | 0.944 |
| -0.134999999999997 | 0.982 | 0.964 | 0.947 |
| -0.131999999999997 | 0.983 | 0.966 | 0.949 |
| -0.128999999999997 | 0.983 | 0.967 | 0.951 |
| -0.125999999999997 | 0.984 | 0.969 | 0.953 |
| -0.122999999999997 | 0.985 | 0.97 | 0.956 |
| -0.119999999999997 | 0.986 | 0.972 | 0.958 |
| -0.116999999999997 | 0.986 | 0.973 | 0.96 |
| -0.113999999999997 | 0.987 | 0.974 | 0.962 |
| -0.110999999999997 | 0.988 | 0.976 | 0.964 |
| -0.107999999999997 | 0.988 | 0.977 | 0.966 |
| -0.104999999999997 | 0.989 | 0.978 | 0.967 |
| -0.101999999999997 | 0.99 | 0.979 | 0.969 |
| -0.0989999999999974 | 0.99 | 0.981 | 0.971 |
| -0.0959999999999974 | 0.991 | 0.982 | 0.973 |
| -0.0929999999999974 | 0.991 | 0.983 | 0.974 |
| -0.0899999999999974 | 0.992 | 0.984 | 0.976 |
| -0.0869999999999974 | 0.992 | 0.985 | 0.978 |
| -0.0839999999999974 | 0.993 | 0.986 | 0.979 |
| -0.0809999999999974 | 0.993 | 0.987 | 0.981 |
| -0.0779999999999974 | 0.994 | 0.988 | 0.982 |
| -0.0749999999999974 | 0.994 | 0.989 | 0.983 |
| -0.0719999999999974 | 0.995 | 0.99 | 0.985 |
| -0.0689999999999974 | 0.995 | 0.991 | 0.986 |
| -0.0659999999999974 | 0.996 | 0.991 | 0.987 |
| -0.0629999999999974 | 0.996 | 0.992 | 0.988 |
| -0.0599999999999974 | 0.996 | 0.993 | 0.989 |
| -0.0569999999999974 | 0.997 | 0.994 | 0.99 |
| -0.0539999999999974 | 0.997 | 0.994 | 0.991 |
| -0.0509999999999974 | 0.997 | 0.995 | 0.992 |
| -0.0479999999999974 | 0.998 | 0.995 | 0.993 |
| -0.0449999999999974 | 0.998 | 0.996 | 0.994 |
| -0.0419999999999974 | 0.998 | 0.996 | 0.995 |
| -0.0389999999999974 | 0.998 | 0.997 | 0.995 |
| -0.0359999999999974 | 0.999 | 0.997 | 0.996 |
| -0.0329999999999974 | 0.999 | 0.998 | 0.997 |
| -0.0299999999999974 | 0.999 | 0.998 | 0.997 |
| -0.0269999999999974 | 0.999 | 0.999 | 0.998 |
| -0.0239999999999974 | 0.999 | 0.999 | 0.998 |
| -0.0209999999999974 | 1 | 0.999 | 0.999 |
| -0.0179999999999974 | 1 | 0.999 | 0.999 |
| -0.0149999999999974 | 1 | 1 | 0.999 |
| -0.0119999999999974 | 1 | 1 | 1 |
| -0.00899999999999737 | 1 | 1 | 1 |
| -0.00599999999999737 | 1 | 1 | 1 |
| -0.00299999999999737 | 1 | 1 | 1 |
| 2.62897342784285e-15 | 1 | 1 | 1 |
| 0.00300000000000263 | 1 | 1 | 1 |
| 0.00600000000000263 | 1 | 1 | 1 |
| 0.00900000000000263 | 1 | 1 | 1 |
| 0.0120000000000026 | 1 | 1 | 1 |
| 0.0150000000000026 | 1 | 1 | 0.999 |
| 0.0180000000000026 | 1 | 0.999 | 0.999 |
| 0.0210000000000026 | 1 | 0.999 | 0.999 |
| 0.0240000000000026 | 0.999 | 0.999 | 0.998 |
| 0.0270000000000026 | 0.999 | 0.999 | 0.998 |
| 0.0300000000000026 | 0.999 | 0.998 | 0.997 |
| 0.0330000000000026 | 0.999 | 0.998 | 0.997 |
| 0.0360000000000026 | 0.999 | 0.997 | 0.996 |
| 0.0390000000000026 | 0.998 | 0.997 | 0.995 |
| 0.0420000000000026 | 0.998 | 0.996 | 0.995 |
| 0.0450000000000026 | 0.998 | 0.996 | 0.994 |
| 0.0480000000000026 | 0.998 | 0.995 | 0.993 |
| 0.0510000000000026 | 0.997 | 0.995 | 0.992 |
| 0.0540000000000026 | 0.997 | 0.994 | 0.991 |
| 0.0570000000000026 | 0.997 | 0.994 | 0.99 |
| 0.0600000000000026 | 0.996 | 0.993 | 0.989 |
| 0.0630000000000026 | 0.996 | 0.992 | 0.988 |
| 0.0660000000000026 | 0.996 | 0.991 | 0.987 |
| 0.0690000000000026 | 0.995 | 0.991 | 0.986 |
| 0.0720000000000027 | 0.995 | 0.99 | 0.985 |
| 0.0750000000000027 | 0.994 | 0.989 | 0.983 |
| 0.0780000000000027 | 0.994 | 0.988 | 0.982 |
| 0.0810000000000027 | 0.993 | 0.987 | 0.981 |
| 0.0840000000000027 | 0.993 | 0.986 | 0.979 |
| 0.0870000000000027 | 0.992 | 0.985 | 0.978 |
| 0.0900000000000027 | 0.992 | 0.984 | 0.976 |
| 0.0930000000000027 | 0.991 | 0.983 | 0.974 |
| 0.0960000000000027 | 0.991 | 0.982 | 0.973 |
| 0.0990000000000027 | 0.99 | 0.981 | 0.971 |
| 0.102000000000003 | 0.99 | 0.979 | 0.969 |
| 0.105000000000003 | 0.989 | 0.978 | 0.967 |
| 0.108000000000003 | 0.988 | 0.977 | 0.966 |
| 0.111000000000003 | 0.988 | 0.976 | 0.964 |
| 0.114000000000003 | 0.987 | 0.974 | 0.962 |
| 0.117000000000003 | 0.986 | 0.973 | 0.96 |
| 0.120000000000003 | 0.986 | 0.972 | 0.958 |
| 0.123000000000003 | 0.985 | 0.97 | 0.956 |
| 0.126000000000003 | 0.984 | 0.969 | 0.953 |
| 0.129000000000003 | 0.983 | 0.967 | 0.951 |
| 0.132000000000003 | 0.983 | 0.966 | 0.949 |
| 0.135000000000003 | 0.982 | 0.964 | 0.947 |
| 0.138000000000003 | 0.981 | 0.963 | 0.944 |
| 0.141000000000003 | 0.98 | 0.961 | 0.942 |
| 0.144000000000003 | 0.979 | 0.959 | 0.94 |
| 0.147000000000003 | 0.979 | 0.958 | 0.937 |
| 0.150000000000003 | 0.978 | 0.956 | 0.935 |
| 0.153000000000003 | 0.977 | 0.954 | 0.932 |
| 0.156000000000003 | 0.976 | 0.952 | 0.93 |
| 0.159000000000003 | 0.975 | 0.951 | 0.927 |
| 0.162000000000003 | 0.974 | 0.949 | 0.924 |
| 0.165000000000003 | 0.973 | 0.947 | 0.922 |
| 0.168000000000003 | 0.972 | 0.945 | 0.919 |
| 0.171000000000003 | 0.971 | 0.943 | 0.916 |
| 0.174000000000003 | 0.97 | 0.941 | 0.913 |
| 0.177000000000003 | 0.969 | 0.939 | 0.91 |
| 0.180000000000003 | 0.968 | 0.937 | 0.907 |
| 0.183000000000003 | 0.967 | 0.935 | 0.904 |
| 0.186000000000003 | 0.966 | 0.933 | 0.901 |
| 0.189000000000003 | 0.965 | 0.931 | 0.898 |
| 0.192000000000003 | 0.964 | 0.929 | 0.895 |
| 0.195000000000003 | 0.963 | 0.927 | 0.892 |
| 0.198000000000003 | 0.962 | 0.925 | 0.889 |
| 0.201000000000003 | 0.96 | 0.922 | 0.886 |
| 0.204000000000003 | 0.959 | 0.92 | 0.883 |
| 0.207000000000003 | 0.958 | 0.918 | 0.879 |
| 0.210000000000003 | 0.957 | 0.916 | 0.876 |
| 0.213000000000003 | 0.956 | 0.913 | 0.873 |
| 0.216000000000003 | 0.954 | 0.911 | 0.869 |
| 0.219000000000003 | 0.953 | 0.909 | 0.866 |
| 0.222000000000003 | 0.952 | 0.906 | 0.863 |
| 0.225000000000003 | 0.951 | 0.904 | 0.859 |
| 0.228000000000003 | 0.949 | 0.901 | 0.856 |
| 0.231000000000003 | 0.948 | 0.899 | 0.852 |
| 0.234000000000003 | 0.947 | 0.896 | 0.849 |
| 0.237000000000003 | 0.945 | 0.894 | 0.845 |
| 0.240000000000003 | 0.944 | 0.891 | 0.841 |
| 0.243000000000003 | 0.943 | 0.889 | 0.838 |
| 0.246000000000003 | 0.941 | 0.886 | 0.834 |
| 0.249000000000003 | 0.94 | 0.883 | 0.83 |
| 0.252000000000003 | 0.938 | 0.881 | 0.827 |
| 0.255000000000003 | 0.937 | 0.878 | 0.823 |
| 0.258000000000003 | 0.936 | 0.875 | 0.819 |
| 0.261000000000003 | 0.934 | 0.873 | 0.815 |
| 0.264000000000003 | 0.933 | 0.87 | 0.811 |
| 0.267000000000003 | 0.931 | 0.867 | 0.807 |
| 0.270000000000003 | 0.93 | 0.864 | 0.804 |
| 0.273000000000003 | 0.928 | 0.862 | 0.8 |
| 0.276000000000003 | 0.927 | 0.859 | 0.796 |
| 0.279000000000003 | 0.925 | 0.856 | 0.792 |
| 0.282000000000003 | 0.924 | 0.853 | 0.788 |
| 0.285000000000003 | 0.922 | 0.85 | 0.784 |
| 0.288000000000003 | 0.92 | 0.847 | 0.78 |
| 0.291000000000003 | 0.919 | 0.844 | 0.776 |
| 0.294000000000003 | 0.917 | 0.841 | 0.772 |
| 0.297000000000003 | 0.916 | 0.838 | 0.767 |
| 0.300000000000003 | 0.914 | 0.835 | 0.763 |
| 0.303000000000003 | 0.912 | 0.832 | 0.759 |
| 0.306000000000003 | 0.911 | 0.829 | 0.755 |
| 0.309000000000003 | 0.909 | 0.826 | 0.751 |
| 0.312000000000003 | 0.907 | 0.823 | 0.747 |
| 0.315000000000003 | 0.906 | 0.82 | 0.743 |
| 0.318000000000003 | 0.904 | 0.817 | 0.738 |
| 0.321000000000003 | 0.902 | 0.814 | 0.734 |
| 0.324000000000003 | 0.9 | 0.811 | 0.73 |
| 0.327000000000003 | 0.899 | 0.807 | 0.726 |
| 0.330000000000003 | 0.897 | 0.804 | 0.721 |
| 0.333000000000003 | 0.895 | 0.801 | 0.717 |
| 0.336000000000003 | 0.893 | 0.798 | 0.713 |
| 0.339000000000003 | 0.891 | 0.795 | 0.708 |
| 0.342000000000003 | 0.89 | 0.791 | 0.704 |
| 0.345000000000003 | 0.888 | 0.788 | 0.7 |
| 0.348000000000003 | 0.886 | 0.785 | 0.695 |
| 0.351000000000003 | 0.884 | 0.782 | 0.691 |
| 0.354000000000003 | 0.882 | 0.778 | 0.687 |
| 0.357000000000003 | 0.88 | 0.775 | 0.682 |
| 0.360000000000003 | 0.878 | 0.772 | 0.678 |
| 0.363000000000003 | 0.877 | 0.768 | 0.673 |
| 0.366000000000003 | 0.875 | 0.765 | 0.669 |
| 0.369000000000003 | 0.873 | 0.762 | 0.665 |
| 0.372000000000003 | 0.871 | 0.758 | 0.66 |
| 0.375000000000003 | 0.869 | 0.755 | 0.656 |
| 0.378000000000003 | 0.867 | 0.751 | 0.651 |
| 0.381000000000003 | 0.865 | 0.748 | 0.647 |
| 0.384000000000003 | 0.863 | 0.745 | 0.643 |
| 0.387000000000003 | 0.861 | 0.741 | 0.638 |
| 0.390000000000003 | 0.859 | 0.738 | 0.634 |
| 0.393000000000003 | 0.857 | 0.734 | 0.629 |
| 0.396000000000003 | 0.855 | 0.731 | 0.625 |
| 0.399000000000003 | 0.853 | 0.727 | 0.62 |
| 0.402000000000003 | 0.851 | 0.724 | 0.616 |
| 0.405000000000003 | 0.849 | 0.72 | 0.611 |
| 0.408000000000003 | 0.847 | 0.717 | 0.607 |
| 0.411000000000003 | 0.845 | 0.713 | 0.602 |
| 0.414000000000003 | 0.842 | 0.71 | 0.598 |
| 0.417000000000003 | 0.84 | 0.706 | 0.594 |
| 0.420000000000003 | 0.838 | 0.703 | 0.589 |
| 0.423000000000003 | 0.836 | 0.699 | 0.585 |
| 0.426000000000003 | 0.834 | 0.696 | 0.58 |
| 0.429000000000003 | 0.832 | 0.692 | 0.576 |
| 0.432000000000003 | 0.83 | 0.688 | 0.571 |
| 0.435000000000003 | 0.828 | 0.685 | 0.567 |
| 0.438000000000003 | 0.825 | 0.681 | 0.562 |
| 0.441000000000003 | 0.823 | 0.678 | 0.558 |
| 0.444000000000003 | 0.821 | 0.674 | 0.554 |
| 0.447000000000003 | 0.819 | 0.671 | 0.549 |
| 0.450000000000003 | 0.817 | 0.667 | 0.545 |
| 0.453000000000003 | 0.814 | 0.663 | 0.54 |
| 0.456000000000003 | 0.812 | 0.66 | 0.536 |
| 0.459000000000003 | 0.81 | 0.656 | 0.532 |
| 0.462000000000003 | 0.808 | 0.653 | 0.527 |
| 0.465000000000003 | 0.806 | 0.649 | 0.523 |
| 0.468000000000003 | 0.803 | 0.645 | 0.518 |
| 0.471000000000003 | 0.801 | 0.642 | 0.514 |
| 0.474000000000003 | 0.799 | 0.638 | 0.51 |
| 0.477000000000003 | 0.796 | 0.634 | 0.505 |
| 0.480000000000003 | 0.794 | 0.631 | 0.501 |
| 0.483000000000003 | 0.792 | 0.627 | 0.497 |
| 0.486000000000003 | 0.79 | 0.624 | 0.492 |
| 0.489000000000003 | 0.787 | 0.62 | 0.488 |
| 0.492000000000003 | 0.785 | 0.616 | 0.484 |
| 0.495000000000003 | 0.783 | 0.613 | 0.479 |
| 0.498000000000003 | 0.78 | 0.609 | 0.475 |
| 0.501000000000003 | 0.778 | 0.605 | 0.471 |
| 0.504000000000003 | 0.776 | 0.602 | 0.467 |
| 0.507000000000003 | 0.773 | 0.598 | 0.462 |
| 0.510000000000003 | 0.771 | 0.594 | 0.458 |
| 0.513000000000003 | 0.769 | 0.591 | 0.454 |
| 0.516000000000003 | 0.766 | 0.587 | 0.45 |
| 0.519000000000003 | 0.764 | 0.583 | 0.446 |
| 0.522000000000003 | 0.761 | 0.58 | 0.442 |
| 0.525000000000003 | 0.759 | 0.576 | 0.437 |
| 0.528000000000003 | 0.757 | 0.573 | 0.433 |
| 0.531000000000003 | 0.754 | 0.569 | 0.429 |
| 0.534000000000003 | 0.752 | 0.565 | 0.425 |
| 0.537000000000003 | 0.749 | 0.562 | 0.421 |
| 0.540000000000003 | 0.747 | 0.558 | 0.417 |
| 0.543000000000003 | 0.745 | 0.554 | 0.413 |
| 0.546000000000003 | 0.742 | 0.551 | 0.409 |
| 0.549000000000003 | 0.74 | 0.547 | 0.405 |
| 0.552000000000003 | 0.737 | 0.544 | 0.401 |
| 0.555000000000003 | 0.735 | 0.54 | 0.397 |
| 0.558000000000003 | 0.732 | 0.536 | 0.393 |
| 0.561000000000003 | 0.73 | 0.533 | 0.389 |
| 0.564000000000003 | 0.728 | 0.529 | 0.385 |
| 0.567000000000003 | 0.725 | 0.526 | 0.381 |
| 0.570000000000003 | 0.723 | 0.522 | 0.377 |
| 0.573000000000003 | 0.72 | 0.519 | 0.373 |
| 0.576000000000003 | 0.718 | 0.515 | 0.37 |
| 0.579000000000003 | 0.715 | 0.511 | 0.366 |
| 0.582000000000003 | 0.713 | 0.508 | 0.362 |
| 0.585000000000003 | 0.71 | 0.504 | 0.358 |
| 0.588000000000003 | 0.708 | 0.501 | 0.354 |
| 0.591000000000003 | 0.705 | 0.497 | 0.351 |
| 0.594000000000003 | 0.703 | 0.494 | 0.347 |
| 0.597000000000003 | 0.7 | 0.49 | 0.343 |
| 0.600000000000003 | 0.698 | 0.487 | 0.34 |
| 0.603000000000003 | 0.695 | 0.483 | 0.336 |
| 0.606000000000003 | 0.693 | 0.48 | 0.332 |
| 0.609000000000003 | 0.69 | 0.476 | 0.329 |
| 0.612000000000003 | 0.688 | 0.473 | 0.325 |
| 0.615000000000003 | 0.685 | 0.469 | 0.322 |
| 0.618000000000003 | 0.683 | 0.466 | 0.318 |
| 0.621000000000003 | 0.68 | 0.462 | 0.314 |
| 0.624000000000003 | 0.677 | 0.459 | 0.311 |
| 0.627000000000003 | 0.675 | 0.456 | 0.307 |
| 0.630000000000003 | 0.672 | 0.452 | 0.304 |
| 0.633000000000003 | 0.67 | 0.449 | 0.301 |
| 0.636000000000003 | 0.667 | 0.445 | 0.297 |
| 0.639000000000003 | 0.665 | 0.442 | 0.294 |
| 0.642000000000003 | 0.662 | 0.439 | 0.29 |
| 0.645000000000003 | 0.66 | 0.435 | 0.287 |
| 0.648000000000003 | 0.657 | 0.432 | 0.284 |
| 0.651000000000003 | 0.655 | 0.428 | 0.28 |
| 0.654000000000003 | 0.652 | 0.425 | 0.277 |
| 0.657000000000003 | 0.649 | 0.422 | 0.274 |
| 0.660000000000003 | 0.647 | 0.418 | 0.271 |
| 0.663000000000003 | 0.644 | 0.415 | 0.267 |
| 0.666000000000003 | 0.642 | 0.412 | 0.264 |
| 0.669000000000003 | 0.639 | 0.409 | 0.261 |
| 0.672000000000003 | 0.637 | 0.405 | 0.258 |
| 0.675000000000003 | 0.634 | 0.402 | 0.255 |
| 0.678000000000003 | 0.631 | 0.399 | 0.252 |
| 0.681000000000003 | 0.629 | 0.396 | 0.249 |
| 0.684000000000003 | 0.626 | 0.392 | 0.246 |
| 0.687000000000003 | 0.624 | 0.389 | 0.243 |
| 0.690000000000003 | 0.621 | 0.386 | 0.24 |
| 0.693000000000003 | 0.619 | 0.383 | 0.237 |
| 0.696000000000003 | 0.616 | 0.38 | 0.234 |
| 0.699000000000003 | 0.613 | 0.376 | 0.231 |
| 0.702000000000003 | 0.611 | 0.373 | 0.228 |
| 0.705000000000003 | 0.608 | 0.37 | 0.225 |
| 0.708000000000003 | 0.606 | 0.367 | 0.222 |
| 0.711000000000003 | 0.603 | 0.364 | 0.219 |
| 0.714000000000003 | 0.601 | 0.361 | 0.217 |
| 0.717000000000003 | 0.598 | 0.358 | 0.214 |
| 0.720000000000003 | 0.595 | 0.355 | 0.211 |
| 0.723000000000003 | 0.593 | 0.352 | 0.208 |
| 0.726000000000003 | 0.59 | 0.348 | 0.206 |
| 0.729000000000003 | 0.588 | 0.345 | 0.203 |
| 0.732000000000003 | 0.585 | 0.342 | 0.2 |
| 0.735000000000003 | 0.583 | 0.339 | 0.198 |
| 0.738000000000003 | 0.58 | 0.336 | 0.195 |
| 0.741000000000003 | 0.577 | 0.333 | 0.193 |
| 0.744000000000003 | 0.575 | 0.331 | 0.19 |
| 0.747000000000003 | 0.572 | 0.328 | 0.187 |
| 0.750000000000003 | 0.57 | 0.325 | 0.185 |
| 0.753000000000003 | 0.567 | 0.322 | 0.182 |
| 0.756000000000003 | 0.565 | 0.319 | 0.18 |
| 0.759000000000003 | 0.562 | 0.316 | 0.178 |
| 0.762000000000003 | 0.56 | 0.313 | 0.175 |
| 0.765000000000003 | 0.557 | 0.31 | 0.173 |
| 0.768000000000003 | 0.554 | 0.307 | 0.17 |
| 0.771000000000003 | 0.552 | 0.305 | 0.168 |
| 0.774000000000003 | 0.549 | 0.302 | 0.166 |
| 0.777000000000003 | 0.547 | 0.299 | 0.163 |
| 0.780000000000003 | 0.544 | 0.296 | 0.161 |
| 0.783000000000003 | 0.542 | 0.293 | 0.159 |
| 0.786000000000003 | 0.539 | 0.291 | 0.157 |
| 0.789000000000003 | 0.537 | 0.288 | 0.154 |
| 0.792000000000003 | 0.534 | 0.285 | 0.152 |
| 0.795000000000003 | 0.532 | 0.283 | 0.15 |
| 0.798000000000003 | 0.529 | 0.28 | 0.148 |
| 0.801000000000003 | 0.526 | 0.277 | 0.146 |
| 0.804000000000003 | 0.524 | 0.274 | 0.144 |
| 0.807000000000003 | 0.521 | 0.272 | 0.142 |
| 0.810000000000003 | 0.519 | 0.269 | 0.14 |
| 0.813000000000003 | 0.516 | 0.267 | 0.138 |
| 0.816000000000003 | 0.514 | 0.264 | 0.136 |
| 0.819000000000003 | 0.511 | 0.261 | 0.134 |
| 0.822000000000003 | 0.509 | 0.259 | 0.132 |
| 0.825000000000003 | 0.506 | 0.256 | 0.13 |
| 0.828000000000003 | 0.504 | 0.254 | 0.128 |
| 0.831000000000003 | 0.501 | 0.251 | 0.126 |
| 0.834000000000003 | 0.499 | 0.249 | 0.124 |
| 0.837000000000003 | 0.496 | 0.246 | 0.122 |
| 0.840000000000003 | 0.494 | 0.244 | 0.12 |
| 0.843000000000003 | 0.491 | 0.241 | 0.119 |
| 0.846000000000003 | 0.489 | 0.239 | 0.117 |
| 0.849000000000003 | 0.486 | 0.237 | 0.115 |
| 0.852000000000003 | 0.484 | 0.234 | 0.113 |
| 0.855000000000003 | 0.481 | 0.232 | 0.112 |
| 0.858000000000003 | 0.479 | 0.229 | 0.11 |
| 0.861000000000003 | 0.476 | 0.227 | 0.108 |
| 0.864000000000003 | 0.474 | 0.225 | 0.107 |
| 0.867000000000003 | 0.472 | 0.222 | 0.105 |
| 0.870000000000003 | 0.469 | 0.22 | 0.103 |
| 0.873000000000003 | 0.467 | 0.218 | 0.102 |
| 0.876000000000003 | 0.464 | 0.216 | 0.1 |
| 0.879000000000003 | 0.462 | 0.213 | 0.098 |
| 0.882000000000003 | 0.459 | 0.211 | 0.097 |
| 0.885000000000003 | 0.457 | 0.209 | 0.095 |
| 0.888000000000003 | 0.455 | 0.207 | 0.094 |
| 0.891000000000003 | 0.452 | 0.204 | 0.092 |
| 0.894000000000003 | 0.45 | 0.202 | 0.091 |
| 0.897000000000003 | 0.447 | 0.2 | 0.089 |
| 0.900000000000003 | 0.445 | 0.198 | 0.088 |
| 0.903000000000003 | 0.442 | 0.196 | 0.087 |
| 0.906000000000003 | 0.44 | 0.194 | 0.085 |
| 0.909000000000003 | 0.438 | 0.192 | 0.084 |
| 0.912000000000003 | 0.435 | 0.189 | 0.082 |
| 0.915000000000003 | 0.433 | 0.187 | 0.081 |
| 0.918000000000003 | 0.431 | 0.185 | 0.08 |
| 0.921000000000003 | 0.428 | 0.183 | 0.078 |
| 0.924000000000003 | 0.426 | 0.181 | 0.077 |
| 0.927000000000003 | 0.423 | 0.179 | 0.076 |
| 0.930000000000003 | 0.421 | 0.177 | 0.075 |
| 0.933000000000003 | 0.419 | 0.175 | 0.073 |
| 0.936000000000003 | 0.416 | 0.173 | 0.072 |
| 0.939000000000003 | 0.414 | 0.171 | 0.071 |
| 0.942000000000003 | 0.412 | 0.17 | 0.07 |
| 0.945000000000003 | 0.409 | 0.168 | 0.069 |
| 0.948000000000003 | 0.407 | 0.166 | 0.067 |
| 0.951000000000003 | 0.405 | 0.164 | 0.066 |
| 0.954000000000003 | 0.402 | 0.162 | 0.065 |
| 0.957000000000003 | 0.4 | 0.16 | 0.064 |
| 0.960000000000003 | 0.398 | 0.158 | 0.063 |
| 0.963000000000003 | 0.396 | 0.156 | 0.062 |
| 0.966000000000003 | 0.393 | 0.155 | 0.061 |
| 0.969000000000003 | 0.391 | 0.153 | 0.06 |
| 0.972000000000003 | 0.389 | 0.151 | 0.059 |
| 0.975000000000003 | 0.386 | 0.149 | 0.058 |
| 0.978000000000003 | 0.384 | 0.148 | 0.057 |
| 0.981000000000003 | 0.382 | 0.146 | 0.056 |
| 0.984000000000003 | 0.38 | 0.144 | 0.055 |
| 0.987000000000003 | 0.378 | 0.143 | 0.054 |
| 0.990000000000003 | 0.375 | 0.141 | 0.053 |
| 0.993000000000003 | 0.373 | 0.139 | 0.052 |
| 0.996000000000003 | 0.371 | 0.138 | 0.051 |
| 0.999000000000003 | 0.369 | 0.136 | 0.05 |
| 1.002000000000003 | 0.366 | 0.134 | 0.049 |
| 1.005000000000003 | 0.364 | 0.133 | 0.048 |
| 1.008000000000003 | 0.362 | 0.131 | 0.047 |
| 1.011000000000003 | 0.36 | 0.129 | 0.047 |
| 1.014000000000003 | 0.358 | 0.128 | 0.046 |
| 1.017000000000003 | 0.355 | 0.126 | 0.045 |
| 1.020000000000003 | 0.353 | 0.125 | 0.044 |
| 1.023000000000003 | 0.351 | 0.123 | 0.043 |
| 1.026000000000002 | 0.349 | 0.122 | 0.043 |
| 1.029000000000002 | 0.347 | 0.12 | 0.042 |
| 1.032000000000002 | 0.345 | 0.119 | 0.041 |
| 1.035000000000002 | 0.343 | 0.117 | 0.04 |
| 1.038000000000002 | 0.34 | 0.116 | 0.039 |
| 1.041000000000002 | 0.338 | 0.114 | 0.039 |
| 1.044000000000002 | 0.336 | 0.113 | 0.038 |
| 1.047000000000002 | 0.334 | 0.112 | 0.037 |
| 1.050000000000002 | 0.332 | 0.11 | 0.037 |
| 1.053000000000001 | 0.33 | 0.109 | 0.036 |
| 1.056000000000001 | 0.328 | 0.107 | 0.035 |
| 1.059000000000001 | 0.326 | 0.106 | 0.035 |
| 1.062000000000001 | 0.324 | 0.105 | 0.034 |
| 1.065000000000001 | 0.322 | 0.103 | 0.033 |
| 1.068000000000001 | 0.32 | 0.102 | 0.033 |
| 1.071000000000001 | 0.318 | 0.101 | 0.032 |
| 1.074000000000001 | 0.316 | 0.1 | 0.031 |
| 1.077000000000001 | 0.314 | 0.098 | 0.031 |
| 1.08 | 0.311 | 0.097 | 0.03 |
| 1.083 | 0.309 | 0.096 | 0.03 |
| 1.086 | 0.307 | 0.095 | 0.029 |
| 1.089 | 0.305 | 0.093 | 0.029 |
| 1.092 | 0.303 | 0.092 | 0.028 |
| 1.095 | 0.301 | 0.091 | 0.027 |
| 1.098 | 0.3 | 0.09 | 0.027 |
| 1.101 | 0.298 | 0.089 | 0.026 |
| 1.104 | 0.296 | 0.087 | 0.026 |
| 1.107 | 0.294 | 0.086 | 0.025 |
| 1.109999999999999 | 0.292 | 0.085 | 0.025 |
| 1.112999999999999 | 0.29 | 0.084 | 0.024 |
| 1.115999999999999 | 0.288 | 0.083 | 0.024 |
| 1.118999999999999 | 0.286 | 0.082 | 0.023 |
| 1.121999999999999 | 0.284 | 0.081 | 0.023 |
| 1.124999999999999 | 0.282 | 0.08 | 0.022 |
| 1.127999999999999 | 0.28 | 0.078 | 0.022 |
| 1.130999999999999 | 0.278 | 0.077 | 0.022 |
| 1.133999999999999 | 0.276 | 0.076 | 0.021 |
| 1.136999999999998 | 0.275 | 0.075 | 0.021 |
| 1.139999999999998 | 0.273 | 0.074 | 0.02 |
| 1.142999999999998 | 0.271 | 0.073 | 0.02 |
| 1.145999999999998 | 0.269 | 0.072 | 0.019 |
| 1.148999999999998 | 0.267 | 0.071 | 0.019 |
| 1.151999999999998 | 0.265 | 0.07 | 0.019 |
| 1.154999999999998 | 0.263 | 0.069 | 0.018 |
| 1.157999999999998 | 0.262 | 0.068 | 0.018 |
| 1.160999999999998 | 0.26 | 0.067 | 0.018 |
| 1.163999999999997 | 0.258 | 0.067 | 0.017 |
| 1.166999999999997 | 0.256 | 0.066 | 0.017 |
| 1.169999999999997 | 0.254 | 0.065 | 0.016 |
| 1.172999999999997 | 0.253 | 0.064 | 0.016 |
| 1.175999999999997 | 0.251 | 0.063 | 0.016 |
| 1.178999999999997 | 0.249 | 0.062 | 0.015 |
| 1.181999999999997 | 0.247 | 0.061 | 0.015 |
| 1.184999999999997 | 0.246 | 0.06 | 0.015 |
| 1.187999999999997 | 0.244 | 0.059 | 0.014 |
| 1.190999999999996 | 0.242 | 0.059 | 0.014 |
| 1.193999999999996 | 0.24 | 0.058 | 0.014 |
| 1.196999999999996 | 0.239 | 0.057 | 0.014 |
| 1.199999999999996 | 0.237 | 0.056 | 0.013 |
| 1.202999999999996 | 0.235 | 0.055 | 0.013 |
| 1.205999999999996 | 0.234 | 0.055 | 0.013 |
| 1.208999999999996 | 0.232 | 0.054 | 0.012 |
| 1.211999999999996 | 0.23 | 0.053 | 0.012 |
| 1.214999999999996 | 0.228 | 0.052 | 0.012 |
| 1.217999999999996 | 0.227 | 0.051 | 0.012 |
| 1.220999999999995 | 0.225 | 0.051 | 0.011 |
| 1.223999999999995 | 0.224 | 0.05 | 0.011 |
| 1.226999999999995 | 0.222 | 0.049 | 0.011 |
| 1.229999999999995 | 0.22 | 0.049 | 0.011 |
| 1.232999999999995 | 0.219 | 0.048 | 0.01 |
| 1.235999999999995 | 0.217 | 0.047 | 0.01 |
| 1.238999999999995 | 0.215 | 0.046 | 0.01 |
| 1.241999999999995 | 0.214 | 0.046 | 0.01 |
| 1.244999999999995 | 0.212 | 0.045 | 0.01 |
| 1.247999999999994 | 0.211 | 0.044 | 0.009 |
| 1.250999999999994 | 0.209 | 0.044 | 0.009 |
| 1.253999999999994 | 0.208 | 0.043 | 0.009 |
| 1.256999999999994 | 0.206 | 0.042 | 0.009 |
| 1.259999999999994 | 0.204 | 0.042 | 0.009 |
| 1.262999999999994 | 0.203 | 0.041 | 0.008 |
| 1.265999999999994 | 0.201 | 0.041 | 0.008 |
| 1.268999999999994 | 0.2 | 0.04 | 0.008 |
| 1.271999999999994 | 0.198 | 0.039 | 0.008 |
| 1.274999999999993 | 0.197 | 0.039 | 0.008 |
| 1.277999999999993 | 0.195 | 0.038 | 0.007 |
| 1.280999999999993 | 0.194 | 0.038 | 0.007 |
| 1.283999999999993 | 0.192 | 0.037 | 0.007 |
| 1.286999999999993 | 0.191 | 0.036 | 0.007 |
| 1.289999999999993 | 0.189 | 0.036 | 0.007 |
| 1.292999999999993 | 0.188 | 0.035 | 0.007 |
| 1.295999999999993 | 0.186 | 0.035 | 0.006 |
| 1.298999999999993 | 0.185 | 0.034 | 0.006 |
| 1.301999999999992 | 0.184 | 0.034 | 0.006 |
| 1.304999999999992 | 0.182 | 0.033 | 0.006 |
| 1.307999999999992 | 0.181 | 0.033 | 0.006 |
| 1.310999999999992 | 0.179 | 0.032 | 0.006 |
| 1.313999999999992 | 0.178 | 0.032 | 0.006 |
| 1.316999999999992 | 0.176 | 0.031 | 0.005 |
| 1.319999999999992 | 0.175 | 0.031 | 0.005 |
| 1.322999999999992 | 0.174 | 0.03 | 0.005 |
| 1.325999999999992 | 0.172 | 0.03 | 0.005 |
| 1.328999999999991 | 0.171 | 0.029 | 0.005 |
| 1.331999999999991 | 0.17 | 0.029 | 0.005 |
| 1.334999999999991 | 0.168 | 0.028 | 0.005 |
| 1.337999999999991 | 0.167 | 0.028 | 0.005 |
| 1.340999999999991 | 0.166 | 0.027 | 0.005 |
| 1.343999999999991 | 0.164 | 0.027 | 0.004 |
| 1.346999999999991 | 0.163 | 0.027 | 0.004 |
| 1.349999999999991 | 0.162 | 0.026 | 0.004 |
| 1.352999999999991 | 0.16 | 0.026 | 0.004 |
| 1.35599999999999 | 0.159 | 0.025 | 0.004 |
| 1.35899999999999 | 0.158 | 0.025 | 0.004 |
| 1.36199999999999 | 0.156 | 0.024 | 0.004 |
| 1.36499999999999 | 0.155 | 0.024 | 0.004 |
| 1.36799999999999 | 0.154 | 0.024 | 0.004 |
| 1.37099999999999 | 0.153 | 0.023 | 0.004 |
| 1.37399999999999 | 0.151 | 0.023 | 0.003 |
| 1.37699999999999 | 0.15 | 0.023 | 0.003 |
| 1.37999999999999 | 0.149 | 0.022 | 0.003 |
| 1.38299999999999 | 0.148 | 0.022 | 0.003 |
| 1.385999999999989 | 0.146 | 0.021 | 0.003 |
| 1.388999999999989 | 0.145 | 0.021 | 0.003 |
| 1.391999999999989 | 0.144 | 0.021 | 0.003 |
| 1.394999999999989 | 0.143 | 0.02 | 0.003 |
| 1.397999999999989 | 0.142 | 0.02 | 0.003 |
| 1.400999999999989 | 0.14 | 0.02 | 0.003 |
| 1.403999999999989 | 0.139 | 0.019 | 0.003 |
| 1.406999999999989 | 0.138 | 0.019 | 0.003 |
| 1.409999999999989 | 0.137 | 0.019 | 0.003 |
| 1.412999999999988 | 0.136 | 0.018 | 0.003 |
| 1.415999999999988 | 0.135 | 0.018 | 0.002 |
| 1.418999999999988 | 0.134 | 0.018 | 0.002 |
| 1.421999999999988 | 0.132 | 0.018 | 0.002 |
| 1.424999999999988 | 0.131 | 0.017 | 0.002 |
| 1.427999999999988 | 0.13 | 0.017 | 0.002 |
| 1.430999999999988 | 0.129 | 0.017 | 0.002 |
| 1.433999999999988 | 0.128 | 0.016 | 0.002 |
| 1.436999999999988 | 0.127 | 0.016 | 0.002 |
| 1.439999999999987 | 0.126 | 0.016 | 0.002 |
| 1.442999999999987 | 0.125 | 0.016 | 0.002 |
| 1.445999999999987 | 0.124 | 0.015 | 0.002 |
| 1.448999999999987 | 0.123 | 0.015 | 0.002 |
| 1.451999999999987 | 0.121 | 0.015 | 0.002 |
| 1.454999999999987 | 0.12 | 0.014 | 0.002 |
| 1.457999999999987 | 0.119 | 0.014 | 0.002 |
| 1.460999999999987 | 0.118 | 0.014 | 0.002 |
| 1.463999999999987 | 0.117 | 0.014 | 0.002 |
| 1.466999999999987 | 0.116 | 0.014 | 0.002 |
| 1.469999999999986 | 0.115 | 0.013 | 0.002 |
| 1.472999999999986 | 0.114 | 0.013 | 0.001 |
| 1.475999999999986 | 0.113 | 0.013 | 0.001 |
| 1.478999999999986 | 0.112 | 0.013 | 0.001 |
| 1.481999999999986 | 0.111 | 0.012 | 0.001 |
| 1.484999999999986 | 0.11 | 0.012 | 0.001 |
| 1.487999999999986 | 0.109 | 0.012 | 0.001 |
| 1.490999999999986 | 0.108 | 0.012 | 0.001 |
| 1.493999999999986 | 0.107 | 0.012 | 0.001 |
| 1.496999999999985 | 0.106 | 0.011 | 0.001 |
| 1.499999999999985 | 0.105 | 0.011 | 0.001 |
| 1.502999999999985 | 0.104 | 0.011 | 0.001 |
| 1.505999999999985 | 0.104 | 0.011 | 0.001 |
| 1.508999999999985 | 0.103 | 0.011 | 0.001 |
| 1.511999999999985 | 0.102 | 0.01 | 0.001 |
| 1.514999999999985 | 0.101 | 0.01 | 0.001 |
| 1.517999999999985 | 0.1 | 0.01 | 0.001 |
| 1.520999999999985 | 0.099 | 0.01 | 0.001 |
| 1.523999999999984 | 0.098 | 0.01 | 0.001 |
| 1.526999999999984 | 0.097 | 0.009 | 0.001 |
| 1.529999999999984 | 0.096 | 0.009 | 0.001 |
| 1.532999999999984 | 0.095 | 0.009 | 0.001 |
| 1.535999999999984 | 0.094 | 0.009 | 0.001 |
| 1.538999999999984 | 0.094 | 0.009 | 0.001 |
| 1.541999999999984 | 0.093 | 0.009 | 0.001 |
| 1.544999999999984 | 0.092 | 0.008 | 0.001 |
| 1.547999999999984 | 0.091 | 0.008 | 0.001 |
| 1.550999999999983 | 0.09 | 0.008 | 0.001 |
| 1.553999999999983 | 0.089 | 0.008 | 0.001 |
| 1.556999999999983 | 0.089 | 0.008 | 0.001 |
| 1.559999999999983 | 0.088 | 0.008 | 0.001 |
| 1.562999999999983 | 0.087 | 0.008 | 0.001 |
| 1.565999999999983 | 0.086 | 0.007 | 0.001 |
| 1.568999999999983 | 0.085 | 0.007 | 0.001 |
| 1.571999999999983 | 0.084 | 0.007 | 0.001 |
| 1.574999999999983 | 0.084 | 0.007 | 0.001 |
| 1.577999999999983 | 0.083 | 0.007 | 0.001 |
| 1.580999999999982 | 0.082 | 0.007 | 0.001 |
| 1.583999999999982 | 0.081 | 0.007 | 0.001 |
| 1.586999999999982 | 0.081 | 0.006 | 0.001 |
| 1.589999999999982 | 0.08 | 0.006 | 0.001 |
| 1.592999999999982 | 0.079 | 0.006 | 0 |
| 1.595999999999982 | 0.078 | 0.006 | 0 |
| 1.598999999999982 | 0.078 | 0.006 | 0 |
| 1.601999999999982 | 0.077 | 0.006 | 0 |
| 1.604999999999981 | 0.076 | 0.006 | 0 |
| 1.607999999999981 | 0.075 | 0.006 | 0 |
| 1.610999999999981 | 0.075 | 0.006 | 0 |
| 1.613999999999981 | 0.074 | 0.005 | 0 |
| 1.616999999999981 | 0.073 | 0.005 | 0 |
| 1.619999999999981 | 0.072 | 0.005 | 0 |
| 1.622999999999981 | 0.072 | 0.005 | 0 |
| 1.625999999999981 | 0.071 | 0.005 | 0 |
| 1.628999999999981 | 0.07 | 0.005 | 0 |
| 1.63199999999998 | 0.07 | 0.005 | 0 |
| 1.63499999999998 | 0.069 | 0.005 | 0 |
| 1.63799999999998 | 0.068 | 0.005 | 0 |
| 1.64099999999998 | 0.068 | 0.005 | 0 |
| 1.64399999999998 | 0.067 | 0.004 | 0 |
| 1.64699999999998 | 0.066 | 0.004 | 0 |
| 1.64999999999998 | 0.066 | 0.004 | 0 |
| 1.65299999999998 | 0.065 | 0.004 | 0 |
| 1.65599999999998 | 0.064 | 0.004 | 0 |
| 1.65899999999998 | 0.064 | 0.004 | 0 |
| 1.661999999999979 | 0.063 | 0.004 | 0 |
| 1.664999999999979 | 0.063 | 0.004 | 0 |
| 1.667999999999979 | 0.062 | 0.004 | 0 |
| 1.670999999999979 | 0.061 | 0.004 | 0 |
| 1.673999999999979 | 0.061 | 0.004 | 0 |
| 1.676999999999979 | 0.06 | 0.004 | 0 |
| 1.679999999999979 | 0.059 | 0.004 | 0 |
| 1.682999999999979 | 0.059 | 0.003 | 0 |
| 1.685999999999979 | 0.058 | 0.003 | 0 |
| 1.688999999999978 | 0.058 | 0.003 | 0 |
| 1.691999999999978 | 0.057 | 0.003 | 0 |
| 1.694999999999978 | 0.057 | 0.003 | 0 |
| 1.697999999999978 | 0.056 | 0.003 | 0 |
| 1.700999999999978 | 0.055 | 0.003 | 0 |
| 1.703999999999978 | 0.055 | 0.003 | 0 |
| 1.706999999999978 | 0.054 | 0.003 | 0 |
| 1.709999999999978 | 0.054 | 0.003 | 0 |
| 1.712999999999978 | 0.053 | 0.003 | 0 |
| 1.715999999999977 | 0.053 | 0.003 | 0 |
| 1.718999999999977 | 0.052 | 0.003 | 0 |
| 1.721999999999977 | 0.052 | 0.003 | 0 |
| 1.724999999999977 | 0.051 | 0.003 | 0 |
| 1.727999999999977 | 0.05 | 0.003 | 0 |
| 1.730999999999977 | 0.05 | 0.002 | 0 |
| 1.733999999999977 | 0.049 | 0.002 | 0 |
| 1.736999999999977 | 0.049 | 0.002 | 0 |
| 1.739999999999977 | 0.048 | 0.002 | 0 |
| 1.742999999999976 | 0.048 | 0.002 | 0 |
| 1.745999999999976 | 0.047 | 0.002 | 0 |
| 1.748999999999976 | 0.047 | 0.002 | 0 |
| 1.751999999999976 | 0.046 | 0.002 | 0 |
| 1.754999999999976 | 0.046 | 0.002 | 0 |
| 1.757999999999976 | 0.045 | 0.002 | 0 |
| 1.760999999999976 | 0.045 | 0.002 | 0 |
| 1.763999999999976 | 0.045 | 0.002 | 0 |
| 1.766999999999976 | 0.044 | 0.002 | 0 |
| 1.769999999999976 | 0.044 | 0.002 | 0 |
| 1.772999999999975 | 0.043 | 0.002 | 0 |
| 1.775999999999975 | 0.043 | 0.002 | 0 |
| 1.778999999999975 | 0.042 | 0.002 | 0 |
| 1.781999999999975 | 0.042 | 0.002 | 0 |
| 1.784999999999975 | 0.041 | 0.002 | 0 |
| 1.787999999999975 | 0.041 | 0.002 | 0 |
| 1.790999999999975 | 0.04 | 0.002 | 0 |
| 1.793999999999975 | 0.04 | 0.002 | 0 |
| 1.796999999999975 | 0.04 | 0.002 | 0 |
| 1.799999999999974 | 0.039 | 0.002 | 0 |
| 1.802999999999974 | 0.039 | 0.002 | 0 |
| 1.805999999999974 | 0.038 | 0.001 | 0 |
| 1.808999999999974 | 0.038 | 0.001 | 0 |
| 1.811999999999974 | 0.038 | 0.001 | 0 |
| 1.814999999999974 | 0.037 | 0.001 | 0 |
| 1.817999999999974 | 0.037 | 0.001 | 0 |
| 1.820999999999974 | 0.036 | 0.001 | 0 |
| 1.823999999999974 | 0.036 | 0.001 | 0 |
| 1.826999999999973 | 0.036 | 0.001 | 0 |
| 1.829999999999973 | 0.035 | 0.001 | 0 |
| 1.832999999999973 | 0.035 | 0.001 | 0 |
| 1.835999999999973 | 0.034 | 0.001 | 0 |
| 1.838999999999973 | 0.034 | 0.001 | 0 |
| 1.841999999999973 | 0.034 | 0.001 | 0 |
| 1.844999999999973 | 0.033 | 0.001 | 0 |
| 1.847999999999973 | 0.033 | 0.001 | 0 |
| 1.850999999999973 | 0.033 | 0.001 | 0 |
| 1.853999999999973 | 0.032 | 0.001 | 0 |
| 1.856999999999972 | 0.032 | 0.001 | 0 |
| 1.859999999999972 | 0.031 | 0.001 | 0 |
| 1.862999999999972 | 0.031 | 0.001 | 0 |
| 1.865999999999972 | 0.031 | 0.001 | 0 |
| 1.868999999999972 | 0.03 | 0.001 | 0 |
| 1.871999999999972 | 0.03 | 0.001 | 0 |
| 1.874999999999972 | 0.03 | 0.001 | 0 |
| 1.877999999999972 | 0.029 | 0.001 | 0 |
| 1.880999999999972 | 0.029 | 0.001 | 0 |
| 1.883999999999971 | 0.029 | 0.001 | 0 |
| 1.886999999999971 | 0.028 | 0.001 | 0 |
| 1.889999999999971 | 0.028 | 0.001 | 0 |
| 1.892999999999971 | 0.028 | 0.001 | 0 |
| 1.895999999999971 | 0.027 | 0.001 | 0 |
| 1.898999999999971 | 0.027 | 0.001 | 0 |
| 1.901999999999971 | 0.027 | 0.001 | 0 |
| 1.904999999999971 | 0.027 | 0.001 | 0 |
| 1.907999999999971 | 0.026 | 0.001 | 0 |
| 1.91099999999997 | 0.026 | 0.001 | 0 |
| 1.91399999999997 | 0.026 | 0.001 | 0 |
| 1.91699999999997 | 0.025 | 0.001 | 0 |
| 1.91999999999997 | 0.025 | 0.001 | 0 |
| 1.92299999999997 | 0.025 | 0.001 | 0 |
| 1.92599999999997 | 0.024 | 0.001 | 0 |
| 1.92899999999997 | 0.024 | 0.001 | 0 |
| 1.93199999999997 | 0.024 | 0.001 | 0 |
| 1.93499999999997 | 0.024 | 0.001 | 0 |
| 1.937999999999969 | 0.023 | 0.001 | 0 |
| 1.940999999999969 | 0.023 | 0.001 | 0 |
| 1.943999999999969 | 0.023 | 0.001 | 0 |
| 1.946999999999969 | 0.023 | 0.001 | 0 |
| 1.949999999999969 | 0.022 | 0 | 0 |
| 1.952999999999969 | 0.022 | 0 | 0 |
| 1.955999999999969 | 0.022 | 0 | 0 |
| 1.958999999999969 | 0.022 | 0 | 0 |
| 1.961999999999969 | 0.021 | 0 | 0 |
| 1.964999999999969 | 0.021 | 0 | 0 |
| 1.967999999999968 | 0.021 | 0 | 0 |
| 1.970999999999968 | 0.021 | 0 | 0 |
| 1.973999999999968 | 0.02 | 0 | 0 |
| 1.976999999999968 | 0.02 | 0 | 0 |
| 1.979999999999968 | 0.02 | 0 | 0 |
| 1.982999999999968 | 0.02 | 0 | 0 |
| 1.985999999999968 | 0.019 | 0 | 0 |
| 1.988999999999968 | 0.019 | 0 | 0 |
| 1.991999999999968 | 0.019 | 0 | 0 |
| 1.994999999999967 | 0.019 | 0 | 0 |
| 1.997999999999967 | 0.018 | 0 | 0 |
| 2.000999999999967 | 0.018 | 0 | 0 |
| 2.003999999999968 | 0.018 | 0 | 0 |
| 2.006999999999968 | 0.018 | 0 | 0 |
| 2.009999999999968 | 0.018 | 0 | 0 |
| 2.012999999999968 | 0.017 | 0 | 0 |
| 2.015999999999968 | 0.017 | 0 | 0 |
| 2.018999999999968 | 0.017 | 0 | 0 |
| 2.021999999999968 | 0.017 | 0 | 0 |
| 2.024999999999968 | 0.017 | 0 | 0 |
| 2.027999999999968 | 0.016 | 0 | 0 |
| 2.030999999999969 | 0.016 | 0 | 0 |
| 2.033999999999969 | 0.016 | 0 | 0 |
| 2.036999999999969 | 0.016 | 0 | 0 |
| 2.039999999999969 | 0.016 | 0 | 0 |
| 2.042999999999969 | 0.015 | 0 | 0 |
| 2.045999999999969 | 0.015 | 0 | 0 |
| 2.048999999999969 | 0.015 | 0 | 0 |
| 2.051999999999969 | 0.015 | 0 | 0 |
| 2.05499999999997 | 0.015 | 0 | 0 |
| 2.05799999999997 | 0.014 | 0 | 0 |
| 2.06099999999997 | 0.014 | 0 | 0 |
| 2.06399999999997 | 0.014 | 0 | 0 |
| 2.06699999999997 | 0.014 | 0 | 0 |
| 2.06999999999997 | 0.014 | 0 | 0 |
| 2.07299999999997 | 0.014 | 0 | 0 |
| 2.07599999999997 | 0.013 | 0 | 0 |
| 2.07899999999997 | 0.013 | 0 | 0 |
| 2.081999999999971 | 0.013 | 0 | 0 |
| 2.084999999999971 | 0.013 | 0 | 0 |
| 2.087999999999971 | 0.013 | 0 | 0 |
| 2.090999999999971 | 0.013 | 0 | 0 |
| 2.093999999999971 | 0.012 | 0 | 0 |
| 2.096999999999971 | 0.012 | 0 | 0 |
| 2.099999999999971 | 0.012 | 0 | 0 |
| 2.102999999999971 | 0.012 | 0 | 0 |
| 2.105999999999971 | 0.012 | 0 | 0 |
| 2.108999999999972 | 0.012 | 0 | 0 |
| 2.111999999999972 | 0.012 | 0 | 0 |
| 2.114999999999972 | 0.011 | 0 | 0 |
| 2.117999999999972 | 0.011 | 0 | 0 |
| 2.120999999999972 | 0.011 | 0 | 0 |
| 2.123999999999972 | 0.011 | 0 | 0 |
| 2.126999999999972 | 0.011 | 0 | 0 |
| 2.129999999999972 | 0.011 | 0 | 0 |
| 2.132999999999972 | 0.011 | 0 | 0 |
| 2.135999999999973 | 0.01 | 0 | 0 |
| 2.138999999999973 | 0.01 | 0 | 0 |
| 2.141999999999973 | 0.01 | 0 | 0 |
| 2.144999999999973 | 0.01 | 0 | 0 |
| 2.147999999999973 | 0.01 | 0 | 0 |
| 2.150999999999973 | 0.01 | 0 | 0 |
| 2.153999999999973 | 0.01 | 0 | 0 |
| 2.156999999999973 | 0.01 | 0 | 0 |
| 2.159999999999973 | 0.009 | 0 | 0 |
| 2.162999999999974 | 0.009 | 0 | 0 |
| 2.165999999999974 | 0.009 | 0 | 0 |
| 2.168999999999974 | 0.009 | 0 | 0 |
| 2.171999999999974 | 0.009 | 0 | 0 |
| 2.174999999999974 | 0.009 | 0 | 0 |
| 2.177999999999974 | 0.009 | 0 | 0 |
| 2.180999999999974 | 0.009 | 0 | 0 |
| 2.183999999999974 | 0.008 | 0 | 0 |
| 2.186999999999974 | 0.008 | 0 | 0 |
| 2.189999999999975 | 0.008 | 0 | 0 |
| 2.192999999999975 | 0.008 | 0 | 0 |
| 2.195999999999975 | 0.008 | 0 | 0 |
| 2.198999999999975 | 0.008 | 0 | 0 |
| 2.201999999999975 | 0.008 | 0 | 0 |
| 2.204999999999975 | 0.008 | 0 | 0 |
| 2.207999999999975 | 0.008 | 0 | 0 |
| 2.210999999999975 | 0.008 | 0 | 0 |
| 2.213999999999976 | 0.007 | 0 | 0 |
| 2.216999999999976 | 0.007 | 0 | 0 |
| 2.219999999999976 | 0.007 | 0 | 0 |
| 2.222999999999976 | 0.007 | 0 | 0 |
| 2.225999999999976 | 0.007 | 0 | 0 |
| 2.228999999999976 | 0.007 | 0 | 0 |
| 2.231999999999976 | 0.007 | 0 | 0 |
| 2.234999999999976 | 0.007 | 0 | 0 |
| 2.237999999999976 | 0.007 | 0 | 0 |
| 2.240999999999976 | 0.007 | 0 | 0 |
| 2.243999999999976 | 0.007 | 0 | 0 |
| 2.246999999999977 | 0.006 | 0 | 0 |
| 2.249999999999977 | 0.006 | 0 | 0 |
| 2.252999999999977 | 0.006 | 0 | 0 |
| 2.255999999999977 | 0.006 | 0 | 0 |
| 2.258999999999977 | 0.006 | 0 | 0 |
| 2.261999999999977 | 0.006 | 0 | 0 |
| 2.264999999999977 | 0.006 | 0 | 0 |
| 2.267999999999977 | 0.006 | 0 | 0 |
| 2.270999999999978 | 0.006 | 0 | 0 |
| 2.273999999999978 | 0.006 | 0 | 0 |
| 2.276999999999978 | 0.006 | 0 | 0 |
| 2.279999999999978 | 0.006 | 0 | 0 |
| 2.282999999999978 | 0.005 | 0 | 0 |
| 2.285999999999978 | 0.005 | 0 | 0 |
| 2.288999999999978 | 0.005 | 0 | 0 |
| 2.291999999999978 | 0.005 | 0 | 0 |
| 2.294999999999979 | 0.005 | 0 | 0 |
| 2.297999999999979 | 0.005 | 0 | 0 |
| 2.300999999999979 | 0.005 | 0 | 0 |
| 2.303999999999979 | 0.005 | 0 | 0 |
| 2.306999999999979 | 0.005 | 0 | 0 |
| 2.309999999999979 | 0.005 | 0 | 0 |
| 2.312999999999979 | 0.005 | 0 | 0 |
| 2.315999999999979 | 0.005 | 0 | 0 |
| 2.318999999999979 | 0.005 | 0 | 0 |
| 2.32199999999998 | 0.005 | 0 | 0 |
| 2.32499999999998 | 0.004 | 0 | 0 |
| 2.32799999999998 | 0.004 | 0 | 0 |
| 2.33099999999998 | 0.004 | 0 | 0 |
| 2.33399999999998 | 0.004 | 0 | 0 |
| 2.33699999999998 | 0.004 | 0 | 0 |
| 2.33999999999998 | 0.004 | 0 | 0 |
| 2.34299999999998 | 0.004 | 0 | 0 |
| 2.34599999999998 | 0.004 | 0 | 0 |
| 2.348999999999981 | 0.004 | 0 | 0 |
| 2.351999999999981 | 0.004 | 0 | 0 |
| 2.354999999999981 | 0.004 | 0 | 0 |
| 2.357999999999981 | 0.004 | 0 | 0 |
| 2.360999999999981 | 0.004 | 0 | 0 |
| 2.363999999999981 | 0.004 | 0 | 0 |
| 2.366999999999981 | 0.004 | 0 | 0 |
| 2.369999999999981 | 0.004 | 0 | 0 |
| 2.372999999999982 | 0.004 | 0 | 0 |
| 2.375999999999982 | 0.004 | 0 | 0 |
| 2.378999999999982 | 0.003 | 0 | 0 |
| 2.381999999999982 | 0.003 | 0 | 0 |
| 2.384999999999982 | 0.003 | 0 | 0 |
| 2.387999999999982 | 0.003 | 0 | 0 |
| 2.390999999999982 | 0.003 | 0 | 0 |
| 2.393999999999982 | 0.003 | 0 | 0 |
| 2.396999999999982 | 0.003 | 0 | 0 |
| 2.399999999999983 | 0.003 | 0 | 0 |
| 2.402999999999983 | 0.003 | 0 | 0 |
| 2.405999999999983 | 0.003 | 0 | 0 |
| 2.408999999999983 | 0.003 | 0 | 0 |
| 2.411999999999983 | 0.003 | 0 | 0 |
| 2.414999999999983 | 0.003 | 0 | 0 |
| 2.417999999999983 | 0.003 | 0 | 0 |
| 2.420999999999983 | 0.003 | 0 | 0 |
| 2.423999999999983 | 0.003 | 0 | 0 |
| 2.426999999999984 | 0.003 | 0 | 0 |
| 2.429999999999984 | 0.003 | 0 | 0 |
| 2.432999999999984 | 0.003 | 0 | 0 |
| 2.435999999999984 | 0.003 | 0 | 0 |
| 2.438999999999984 | 0.003 | 0 | 0 |
| 2.441999999999984 | 0.003 | 0 | 0 |
| 2.444999999999984 | 0.003 | 0 | 0 |
| 2.447999999999984 | 0.002 | 0 | 0 |
| 2.450999999999984 | 0.002 | 0 | 0 |
| 2.453999999999985 | 0.002 | 0 | 0 |
| 2.456999999999985 | 0.002 | 0 | 0 |
| 2.459999999999985 | 0.002 | 0 | 0 |
| 2.462999999999985 | 0.002 | 0 | 0 |
| 2.465999999999985 | 0.002 | 0 | 0 |
| 2.468999999999985 | 0.002 | 0 | 0 |
| 2.471999999999985 | 0.002 | 0 | 0 |
| 2.474999999999985 | 0.002 | 0 | 0 |
| 2.477999999999986 | 0.002 | 0 | 0 |
| 2.480999999999986 | 0.002 | 0 | 0 |
| 2.483999999999986 | 0.002 | 0 | 0 |
| 2.486999999999986 | 0.002 | 0 | 0 |
| 2.489999999999986 | 0.002 | 0 | 0 |
| 2.492999999999986 | 0.002 | 0 | 0 |
| 2.495999999999986 | 0.002 | 0 | 0 |
| 2.498999999999986 | 0.002 | 0 | 0 |
| 2.501999999999986 | 0.002 | 0 | 0 |
| 2.504999999999987 | 0.002 | 0 | 0 |
| 2.507999999999987 | 0.002 | 0 | 0 |
| 2.510999999999987 | 0.002 | 0 | 0 |
| 2.513999999999987 | 0.002 | 0 | 0 |
| 2.516999999999987 | 0.002 | 0 | 0 |
| 2.519999999999987 | 0.002 | 0 | 0 |
| 2.522999999999987 | 0.002 | 0 | 0 |
| 2.525999999999987 | 0.002 | 0 | 0 |
| 2.528999999999987 | 0.002 | 0 | 0 |
| 2.531999999999988 | 0.002 | 0 | 0 |
| 2.534999999999988 | 0.002 | 0 | 0 |
| 2.537999999999988 | 0.002 | 0 | 0 |
| 2.540999999999988 | 0.002 | 0 | 0 |
| 2.543999999999988 | 0.002 | 0 | 0 |
| 2.546999999999988 | 0.002 | 0 | 0 |
| 2.549999999999988 | 0.001 | 0 | 0 |
| 2.552999999999988 | 0.001 | 0 | 0 |
| 2.555999999999988 | 0.001 | 0 | 0 |
| 2.558999999999989 | 0.001 | 0 | 0 |
| 2.561999999999989 | 0.001 | 0 | 0 |
| 2.564999999999989 | 0.001 | 0 | 0 |
| 2.567999999999989 | 0.001 | 0 | 0 |
| 2.570999999999989 | 0.001 | 0 | 0 |
| 2.573999999999989 | 0.001 | 0 | 0 |
| 2.576999999999989 | 0.001 | 0 | 0 |
| 2.579999999999989 | 0.001 | 0 | 0 |
| 2.58299999999999 | 0.001 | 0 | 0 |
| 2.58599999999999 | 0.001 | 0 | 0 |
| 2.58899999999999 | 0.001 | 0 | 0 |
| 2.59199999999999 | 0.001 | 0 | 0 |
| 2.59499999999999 | 0.001 | 0 | 0 |
| 2.59799999999999 | 0.001 | 0 | 0 |
| 2.60099999999999 | 0.001 | 0 | 0 |
| 2.60399999999999 | 0.001 | 0 | 0 |
| 2.60699999999999 | 0.001 | 0 | 0 |
| 2.60999999999999 | 0.001 | 0 | 0 |
| 2.612999999999991 | 0.001 | 0 | 0 |
| 2.615999999999991 | 0.001 | 0 | 0 |
| 2.618999999999991 | 0.001 | 0 | 0 |
| 2.621999999999991 | 0.001 | 0 | 0 |
| 2.624999999999991 | 0.001 | 0 | 0 |
| 2.627999999999991 | 0.001 | 0 | 0 |
| 2.630999999999991 | 0.001 | 0 | 0 |
| 2.633999999999991 | 0.001 | 0 | 0 |
| 2.636999999999991 | 0.001 | 0 | 0 |
| 2.639999999999992 | 0.001 | 0 | 0 |
| 2.642999999999992 | 0.001 | 0 | 0 |
| 2.645999999999992 | 0.001 | 0 | 0 |
| 2.648999999999992 | 0.001 | 0 | 0 |
| 2.651999999999992 | 0.001 | 0 | 0 |
| 2.654999999999992 | 0.001 | 0 | 0 |
| 2.657999999999992 | 0.001 | 0 | 0 |
| 2.660999999999992 | 0.001 | 0 | 0 |
| 2.663999999999992 | 0.001 | 0 | 0 |
| 2.666999999999993 | 0.001 | 0 | 0 |
| 2.669999999999993 | 0.001 | 0 | 0 |
| 2.672999999999993 | 0.001 | 0 | 0 |
| 2.675999999999993 | 0.001 | 0 | 0 |
| 2.678999999999993 | 0.001 | 0 | 0 |
| 2.681999999999993 | 0.001 | 0 | 0 |
| 2.684999999999993 | 0.001 | 0 | 0 |
| 2.687999999999993 | 0.001 | 0 | 0 |
| 2.690999999999994 | 0.001 | 0 | 0 |
| 2.693999999999994 | 0.001 | 0 | 0 |
| 2.696999999999994 | 0.001 | 0 | 0 |
| 2.699999999999994 | 0.001 | 0 | 0 |
| 2.702999999999994 | 0.001 | 0 | 0 |
| 2.705999999999994 | 0.001 | 0 | 0 |
| 2.708999999999994 | 0.001 | 0 | 0 |
| 2.711999999999994 | 0.001 | 0 | 0 |
| 2.714999999999994 | 0.001 | 0 | 0 |
| 2.717999999999995 | 0.001 | 0 | 0 |
| 2.720999999999995 | 0.001 | 0 | 0 |
| 2.723999999999995 | 0.001 | 0 | 0 |
| 2.726999999999995 | 0.001 | 0 | 0 |
| 2.729999999999995 | 0.001 | 0 | 0 |
| 2.732999999999995 | 0.001 | 0 | 0 |
| 2.735999999999995 | 0.001 | 0 | 0 |
| 2.738999999999995 | 0.001 | 0 | 0 |
| 2.741999999999995 | 0.001 | 0 | 0 |
| 2.744999999999996 | 0.001 | 0 | 0 |
| 2.747999999999996 | 0.001 | 0 | 0 |
| 2.750999999999996 | 0.001 | 0 | 0 |
| 2.753999999999996 | 0.001 | 0 | 0 |
| 2.756999999999996 | 0 | 0 | 0 |
| 2.759999999999996 | 0 | 0 | 0 |
| 2.762999999999996 | 0 | 0 | 0 |
| 2.765999999999996 | 0 | 0 | 0 |
| 2.768999999999996 | 0 | 0 | 0 |
| 2.771999999999997 | 0 | 0 | 0 |
| 2.774999999999997 | 0 | 0 | 0 |
| 2.777999999999997 | 0 | 0 | 0 |
| 2.780999999999997 | 0 | 0 | 0 |
| 2.783999999999997 | 0 | 0 | 0 |
| 2.786999999999997 | 0 | 0 | 0 |
| 2.789999999999997 | 0 | 0 | 0 |
| 2.792999999999997 | 0 | 0 | 0 |
| 2.795999999999998 | 0 | 0 | 0 |
| 2.798999999999998 | 0 | 0 | 0 |
| 2.801999999999998 | 0 | 0 | 0 |
| 2.804999999999998 | 0 | 0 | 0 |
| 2.807999999999998 | 0 | 0 | 0 |
| 2.810999999999998 | 0 | 0 | 0 |
| 2.813999999999998 | 0 | 0 | 0 |
| 2.816999999999998 | 0 | 0 | 0 |
| 2.819999999999998 | 0 | 0 | 0 |
| 2.822999999999999 | 0 | 0 | 0 |
| 2.825999999999999 | 0 | 0 | 0 |
| 2.828999999999999 | 0 | 0 | 0 |
| 2.831999999999999 | 0 | 0 | 0 |
| 2.834999999999999 | 0 | 0 | 0 |
| 2.837999999999999 | 0 | 0 | 0 |
| 2.840999999999999 | 0 | 0 | 0 |
| 2.843999999999999 | 0 | 0 | 0 |
| 2.846999999999999 | 0 | 0 | 0 |
| 2.85 | 0 | 0 | 0 |
| 2.853 | 0 | 0 | 0 |
| 2.856 | 0 | 0 | 0 |
| 2.859 | 0 | 0 | 0 |
| 2.862 | 0 | 0 | 0 |
| 2.865 | 0 | 0 | 0 |
| 2.868 | 0 | 0 | 0 |
| 2.871 | 0 | 0 | 0 |
| 2.874000000000001 | 0 | 0 | 0 |
| 2.877000000000001 | 0 | 0 | 0 |
| 2.880000000000001 | 0 | 0 | 0 |
| 2.883000000000001 | 0 | 0 | 0 |
| 2.886000000000001 | 0 | 0 | 0 |
| 2.889000000000001 | 0 | 0 | 0 |
| 2.892000000000001 | 0 | 0 | 0 |
| 2.895000000000001 | 0 | 0 | 0 |
| 2.898000000000001 | 0 | 0 | 0 |
| 2.901000000000002 | 0 | 0 | 0 |
| 2.904000000000002 | 0 | 0 | 0 |
| 2.907000000000002 | 0 | 0 | 0 |
| 2.910000000000002 | 0 | 0 | 0 |
| 2.913000000000002 | 0 | 0 | 0 |
| 2.916000000000002 | 0 | 0 | 0 |
| 2.919000000000002 | 0 | 0 | 0 |
| 2.922000000000002 | 0 | 0 | 0 |
| 2.925000000000002 | 0 | 0 | 0 |
| 2.928000000000003 | 0 | 0 | 0 |
| 2.931000000000003 | 0 | 0 | 0 |
| 2.934000000000003 | 0 | 0 | 0 |
| 2.937000000000003 | 0 | 0 | 0 |
| 2.940000000000003 | 0 | 0 | 0 |
| 2.943000000000003 | 0 | 0 | 0 |
| 2.946000000000003 | 0 | 0 | 0 |
| 2.949000000000003 | 0 | 0 | 0 |
| 2.952000000000003 | 0 | 0 | 0 |
| 2.955000000000004 | 0 | 0 | 0 |
| 2.958000000000004 | 0 | 0 | 0 |
| 2.961000000000004 | 0 | 0 | 0 |
| 2.964000000000004 | 0 | 0 | 0 |
| 2.967000000000004 | 0 | 0 | 0 |
| 2.970000000000004 | 0 | 0 | 0 |
| 2.973000000000004 | 0 | 0 | 0 |
| 2.976000000000004 | 0 | 0 | 0 |
| 2.979000000000005 | 0 | 0 | 0 |
| 2.982000000000005 | 0 | 0 | 0 |
| 2.985000000000005 | 0 | 0 | 0 |
| 2.988000000000005 | 0 | 0 | 0 |
| 2.991000000000005 | 0 | 0 | 0 |
| 2.994000000000005 | 0 | 0 | 0 |
| 2.997000000000005 | 0 | 0 | 0 |
| 3.000000000000005 | 0 | 0 | 0 |